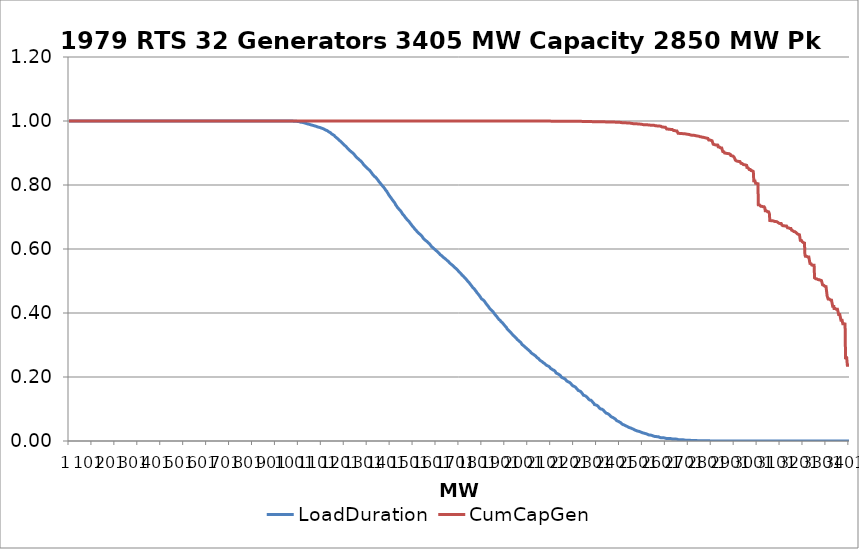
| Category | LoadDuration | CumCapGen |
|---|---|---|
| 0 | 1 | 1 |
| 1 | 1 | 1 |
| 2 | 1 | 1 |
| 3 | 1 | 1 |
| 4 | 1 | 1 |
| 5 | 1 | 1 |
| 6 | 1 | 1 |
| 7 | 1 | 1 |
| 8 | 1 | 1 |
| 9 | 1 | 1 |
| 10 | 1 | 1 |
| 11 | 1 | 1 |
| 12 | 1 | 1 |
| 13 | 1 | 1 |
| 14 | 1 | 1 |
| 15 | 1 | 1 |
| 16 | 1 | 1 |
| 17 | 1 | 1 |
| 18 | 1 | 1 |
| 19 | 1 | 1 |
| 20 | 1 | 1 |
| 21 | 1 | 1 |
| 22 | 1 | 1 |
| 23 | 1 | 1 |
| 24 | 1 | 1 |
| 25 | 1 | 1 |
| 26 | 1 | 1 |
| 27 | 1 | 1 |
| 28 | 1 | 1 |
| 29 | 1 | 1 |
| 30 | 1 | 1 |
| 31 | 1 | 1 |
| 32 | 1 | 1 |
| 33 | 1 | 1 |
| 34 | 1 | 1 |
| 35 | 1 | 1 |
| 36 | 1 | 1 |
| 37 | 1 | 1 |
| 38 | 1 | 1 |
| 39 | 1 | 1 |
| 40 | 1 | 1 |
| 41 | 1 | 1 |
| 42 | 1 | 1 |
| 43 | 1 | 1 |
| 44 | 1 | 1 |
| 45 | 1 | 1 |
| 46 | 1 | 1 |
| 47 | 1 | 1 |
| 48 | 1 | 1 |
| 49 | 1 | 1 |
| 50 | 1 | 1 |
| 51 | 1 | 1 |
| 52 | 1 | 1 |
| 53 | 1 | 1 |
| 54 | 1 | 1 |
| 55 | 1 | 1 |
| 56 | 1 | 1 |
| 57 | 1 | 1 |
| 58 | 1 | 1 |
| 59 | 1 | 1 |
| 60 | 1 | 1 |
| 61 | 1 | 1 |
| 62 | 1 | 1 |
| 63 | 1 | 1 |
| 64 | 1 | 1 |
| 65 | 1 | 1 |
| 66 | 1 | 1 |
| 67 | 1 | 1 |
| 68 | 1 | 1 |
| 69 | 1 | 1 |
| 70 | 1 | 1 |
| 71 | 1 | 1 |
| 72 | 1 | 1 |
| 73 | 1 | 1 |
| 74 | 1 | 1 |
| 75 | 1 | 1 |
| 76 | 1 | 1 |
| 77 | 1 | 1 |
| 78 | 1 | 1 |
| 79 | 1 | 1 |
| 80 | 1 | 1 |
| 81 | 1 | 1 |
| 82 | 1 | 1 |
| 83 | 1 | 1 |
| 84 | 1 | 1 |
| 85 | 1 | 1 |
| 86 | 1 | 1 |
| 87 | 1 | 1 |
| 88 | 1 | 1 |
| 89 | 1 | 1 |
| 90 | 1 | 1 |
| 91 | 1 | 1 |
| 92 | 1 | 1 |
| 93 | 1 | 1 |
| 94 | 1 | 1 |
| 95 | 1 | 1 |
| 96 | 1 | 1 |
| 97 | 1 | 1 |
| 98 | 1 | 1 |
| 99 | 1 | 1 |
| 100 | 1 | 1 |
| 101 | 1 | 1 |
| 102 | 1 | 1 |
| 103 | 1 | 1 |
| 104 | 1 | 1 |
| 105 | 1 | 1 |
| 106 | 1 | 1 |
| 107 | 1 | 1 |
| 108 | 1 | 1 |
| 109 | 1 | 1 |
| 110 | 1 | 1 |
| 111 | 1 | 1 |
| 112 | 1 | 1 |
| 113 | 1 | 1 |
| 114 | 1 | 1 |
| 115 | 1 | 1 |
| 116 | 1 | 1 |
| 117 | 1 | 1 |
| 118 | 1 | 1 |
| 119 | 1 | 1 |
| 120 | 1 | 1 |
| 121 | 1 | 1 |
| 122 | 1 | 1 |
| 123 | 1 | 1 |
| 124 | 1 | 1 |
| 125 | 1 | 1 |
| 126 | 1 | 1 |
| 127 | 1 | 1 |
| 128 | 1 | 1 |
| 129 | 1 | 1 |
| 130 | 1 | 1 |
| 131 | 1 | 1 |
| 132 | 1 | 1 |
| 133 | 1 | 1 |
| 134 | 1 | 1 |
| 135 | 1 | 1 |
| 136 | 1 | 1 |
| 137 | 1 | 1 |
| 138 | 1 | 1 |
| 139 | 1 | 1 |
| 140 | 1 | 1 |
| 141 | 1 | 1 |
| 142 | 1 | 1 |
| 143 | 1 | 1 |
| 144 | 1 | 1 |
| 145 | 1 | 1 |
| 146 | 1 | 1 |
| 147 | 1 | 1 |
| 148 | 1 | 1 |
| 149 | 1 | 1 |
| 150 | 1 | 1 |
| 151 | 1 | 1 |
| 152 | 1 | 1 |
| 153 | 1 | 1 |
| 154 | 1 | 1 |
| 155 | 1 | 1 |
| 156 | 1 | 1 |
| 157 | 1 | 1 |
| 158 | 1 | 1 |
| 159 | 1 | 1 |
| 160 | 1 | 1 |
| 161 | 1 | 1 |
| 162 | 1 | 1 |
| 163 | 1 | 1 |
| 164 | 1 | 1 |
| 165 | 1 | 1 |
| 166 | 1 | 1 |
| 167 | 1 | 1 |
| 168 | 1 | 1 |
| 169 | 1 | 1 |
| 170 | 1 | 1 |
| 171 | 1 | 1 |
| 172 | 1 | 1 |
| 173 | 1 | 1 |
| 174 | 1 | 1 |
| 175 | 1 | 1 |
| 176 | 1 | 1 |
| 177 | 1 | 1 |
| 178 | 1 | 1 |
| 179 | 1 | 1 |
| 180 | 1 | 1 |
| 181 | 1 | 1 |
| 182 | 1 | 1 |
| 183 | 1 | 1 |
| 184 | 1 | 1 |
| 185 | 1 | 1 |
| 186 | 1 | 1 |
| 187 | 1 | 1 |
| 188 | 1 | 1 |
| 189 | 1 | 1 |
| 190 | 1 | 1 |
| 191 | 1 | 1 |
| 192 | 1 | 1 |
| 193 | 1 | 1 |
| 194 | 1 | 1 |
| 195 | 1 | 1 |
| 196 | 1 | 1 |
| 197 | 1 | 1 |
| 198 | 1 | 1 |
| 199 | 1 | 1 |
| 200 | 1 | 1 |
| 201 | 1 | 1 |
| 202 | 1 | 1 |
| 203 | 1 | 1 |
| 204 | 1 | 1 |
| 205 | 1 | 1 |
| 206 | 1 | 1 |
| 207 | 1 | 1 |
| 208 | 1 | 1 |
| 209 | 1 | 1 |
| 210 | 1 | 1 |
| 211 | 1 | 1 |
| 212 | 1 | 1 |
| 213 | 1 | 1 |
| 214 | 1 | 1 |
| 215 | 1 | 1 |
| 216 | 1 | 1 |
| 217 | 1 | 1 |
| 218 | 1 | 1 |
| 219 | 1 | 1 |
| 220 | 1 | 1 |
| 221 | 1 | 1 |
| 222 | 1 | 1 |
| 223 | 1 | 1 |
| 224 | 1 | 1 |
| 225 | 1 | 1 |
| 226 | 1 | 1 |
| 227 | 1 | 1 |
| 228 | 1 | 1 |
| 229 | 1 | 1 |
| 230 | 1 | 1 |
| 231 | 1 | 1 |
| 232 | 1 | 1 |
| 233 | 1 | 1 |
| 234 | 1 | 1 |
| 235 | 1 | 1 |
| 236 | 1 | 1 |
| 237 | 1 | 1 |
| 238 | 1 | 1 |
| 239 | 1 | 1 |
| 240 | 1 | 1 |
| 241 | 1 | 1 |
| 242 | 1 | 1 |
| 243 | 1 | 1 |
| 244 | 1 | 1 |
| 245 | 1 | 1 |
| 246 | 1 | 1 |
| 247 | 1 | 1 |
| 248 | 1 | 1 |
| 249 | 1 | 1 |
| 250 | 1 | 1 |
| 251 | 1 | 1 |
| 252 | 1 | 1 |
| 253 | 1 | 1 |
| 254 | 1 | 1 |
| 255 | 1 | 1 |
| 256 | 1 | 1 |
| 257 | 1 | 1 |
| 258 | 1 | 1 |
| 259 | 1 | 1 |
| 260 | 1 | 1 |
| 261 | 1 | 1 |
| 262 | 1 | 1 |
| 263 | 1 | 1 |
| 264 | 1 | 1 |
| 265 | 1 | 1 |
| 266 | 1 | 1 |
| 267 | 1 | 1 |
| 268 | 1 | 1 |
| 269 | 1 | 1 |
| 270 | 1 | 1 |
| 271 | 1 | 1 |
| 272 | 1 | 1 |
| 273 | 1 | 1 |
| 274 | 1 | 1 |
| 275 | 1 | 1 |
| 276 | 1 | 1 |
| 277 | 1 | 1 |
| 278 | 1 | 1 |
| 279 | 1 | 1 |
| 280 | 1 | 1 |
| 281 | 1 | 1 |
| 282 | 1 | 1 |
| 283 | 1 | 1 |
| 284 | 1 | 1 |
| 285 | 1 | 1 |
| 286 | 1 | 1 |
| 287 | 1 | 1 |
| 288 | 1 | 1 |
| 289 | 1 | 1 |
| 290 | 1 | 1 |
| 291 | 1 | 1 |
| 292 | 1 | 1 |
| 293 | 1 | 1 |
| 294 | 1 | 1 |
| 295 | 1 | 1 |
| 296 | 1 | 1 |
| 297 | 1 | 1 |
| 298 | 1 | 1 |
| 299 | 1 | 1 |
| 300 | 1 | 1 |
| 301 | 1 | 1 |
| 302 | 1 | 1 |
| 303 | 1 | 1 |
| 304 | 1 | 1 |
| 305 | 1 | 1 |
| 306 | 1 | 1 |
| 307 | 1 | 1 |
| 308 | 1 | 1 |
| 309 | 1 | 1 |
| 310 | 1 | 1 |
| 311 | 1 | 1 |
| 312 | 1 | 1 |
| 313 | 1 | 1 |
| 314 | 1 | 1 |
| 315 | 1 | 1 |
| 316 | 1 | 1 |
| 317 | 1 | 1 |
| 318 | 1 | 1 |
| 319 | 1 | 1 |
| 320 | 1 | 1 |
| 321 | 1 | 1 |
| 322 | 1 | 1 |
| 323 | 1 | 1 |
| 324 | 1 | 1 |
| 325 | 1 | 1 |
| 326 | 1 | 1 |
| 327 | 1 | 1 |
| 328 | 1 | 1 |
| 329 | 1 | 1 |
| 330 | 1 | 1 |
| 331 | 1 | 1 |
| 332 | 1 | 1 |
| 333 | 1 | 1 |
| 334 | 1 | 1 |
| 335 | 1 | 1 |
| 336 | 1 | 1 |
| 337 | 1 | 1 |
| 338 | 1 | 1 |
| 339 | 1 | 1 |
| 340 | 1 | 1 |
| 341 | 1 | 1 |
| 342 | 1 | 1 |
| 343 | 1 | 1 |
| 344 | 1 | 1 |
| 345 | 1 | 1 |
| 346 | 1 | 1 |
| 347 | 1 | 1 |
| 348 | 1 | 1 |
| 349 | 1 | 1 |
| 350 | 1 | 1 |
| 351 | 1 | 1 |
| 352 | 1 | 1 |
| 353 | 1 | 1 |
| 354 | 1 | 1 |
| 355 | 1 | 1 |
| 356 | 1 | 1 |
| 357 | 1 | 1 |
| 358 | 1 | 1 |
| 359 | 1 | 1 |
| 360 | 1 | 1 |
| 361 | 1 | 1 |
| 362 | 1 | 1 |
| 363 | 1 | 1 |
| 364 | 1 | 1 |
| 365 | 1 | 1 |
| 366 | 1 | 1 |
| 367 | 1 | 1 |
| 368 | 1 | 1 |
| 369 | 1 | 1 |
| 370 | 1 | 1 |
| 371 | 1 | 1 |
| 372 | 1 | 1 |
| 373 | 1 | 1 |
| 374 | 1 | 1 |
| 375 | 1 | 1 |
| 376 | 1 | 1 |
| 377 | 1 | 1 |
| 378 | 1 | 1 |
| 379 | 1 | 1 |
| 380 | 1 | 1 |
| 381 | 1 | 1 |
| 382 | 1 | 1 |
| 383 | 1 | 1 |
| 384 | 1 | 1 |
| 385 | 1 | 1 |
| 386 | 1 | 1 |
| 387 | 1 | 1 |
| 388 | 1 | 1 |
| 389 | 1 | 1 |
| 390 | 1 | 1 |
| 391 | 1 | 1 |
| 392 | 1 | 1 |
| 393 | 1 | 1 |
| 394 | 1 | 1 |
| 395 | 1 | 1 |
| 396 | 1 | 1 |
| 397 | 1 | 1 |
| 398 | 1 | 1 |
| 399 | 1 | 1 |
| 400 | 1 | 1 |
| 401 | 1 | 1 |
| 402 | 1 | 1 |
| 403 | 1 | 1 |
| 404 | 1 | 1 |
| 405 | 1 | 1 |
| 406 | 1 | 1 |
| 407 | 1 | 1 |
| 408 | 1 | 1 |
| 409 | 1 | 1 |
| 410 | 1 | 1 |
| 411 | 1 | 1 |
| 412 | 1 | 1 |
| 413 | 1 | 1 |
| 414 | 1 | 1 |
| 415 | 1 | 1 |
| 416 | 1 | 1 |
| 417 | 1 | 1 |
| 418 | 1 | 1 |
| 419 | 1 | 1 |
| 420 | 1 | 1 |
| 421 | 1 | 1 |
| 422 | 1 | 1 |
| 423 | 1 | 1 |
| 424 | 1 | 1 |
| 425 | 1 | 1 |
| 426 | 1 | 1 |
| 427 | 1 | 1 |
| 428 | 1 | 1 |
| 429 | 1 | 1 |
| 430 | 1 | 1 |
| 431 | 1 | 1 |
| 432 | 1 | 1 |
| 433 | 1 | 1 |
| 434 | 1 | 1 |
| 435 | 1 | 1 |
| 436 | 1 | 1 |
| 437 | 1 | 1 |
| 438 | 1 | 1 |
| 439 | 1 | 1 |
| 440 | 1 | 1 |
| 441 | 1 | 1 |
| 442 | 1 | 1 |
| 443 | 1 | 1 |
| 444 | 1 | 1 |
| 445 | 1 | 1 |
| 446 | 1 | 1 |
| 447 | 1 | 1 |
| 448 | 1 | 1 |
| 449 | 1 | 1 |
| 450 | 1 | 1 |
| 451 | 1 | 1 |
| 452 | 1 | 1 |
| 453 | 1 | 1 |
| 454 | 1 | 1 |
| 455 | 1 | 1 |
| 456 | 1 | 1 |
| 457 | 1 | 1 |
| 458 | 1 | 1 |
| 459 | 1 | 1 |
| 460 | 1 | 1 |
| 461 | 1 | 1 |
| 462 | 1 | 1 |
| 463 | 1 | 1 |
| 464 | 1 | 1 |
| 465 | 1 | 1 |
| 466 | 1 | 1 |
| 467 | 1 | 1 |
| 468 | 1 | 1 |
| 469 | 1 | 1 |
| 470 | 1 | 1 |
| 471 | 1 | 1 |
| 472 | 1 | 1 |
| 473 | 1 | 1 |
| 474 | 1 | 1 |
| 475 | 1 | 1 |
| 476 | 1 | 1 |
| 477 | 1 | 1 |
| 478 | 1 | 1 |
| 479 | 1 | 1 |
| 480 | 1 | 1 |
| 481 | 1 | 1 |
| 482 | 1 | 1 |
| 483 | 1 | 1 |
| 484 | 1 | 1 |
| 485 | 1 | 1 |
| 486 | 1 | 1 |
| 487 | 1 | 1 |
| 488 | 1 | 1 |
| 489 | 1 | 1 |
| 490 | 1 | 1 |
| 491 | 1 | 1 |
| 492 | 1 | 1 |
| 493 | 1 | 1 |
| 494 | 1 | 1 |
| 495 | 1 | 1 |
| 496 | 1 | 1 |
| 497 | 1 | 1 |
| 498 | 1 | 1 |
| 499 | 1 | 1 |
| 500 | 1 | 1 |
| 501 | 1 | 1 |
| 502 | 1 | 1 |
| 503 | 1 | 1 |
| 504 | 1 | 1 |
| 505 | 1 | 1 |
| 506 | 1 | 1 |
| 507 | 1 | 1 |
| 508 | 1 | 1 |
| 509 | 1 | 1 |
| 510 | 1 | 1 |
| 511 | 1 | 1 |
| 512 | 1 | 1 |
| 513 | 1 | 1 |
| 514 | 1 | 1 |
| 515 | 1 | 1 |
| 516 | 1 | 1 |
| 517 | 1 | 1 |
| 518 | 1 | 1 |
| 519 | 1 | 1 |
| 520 | 1 | 1 |
| 521 | 1 | 1 |
| 522 | 1 | 1 |
| 523 | 1 | 1 |
| 524 | 1 | 1 |
| 525 | 1 | 1 |
| 526 | 1 | 1 |
| 527 | 1 | 1 |
| 528 | 1 | 1 |
| 529 | 1 | 1 |
| 530 | 1 | 1 |
| 531 | 1 | 1 |
| 532 | 1 | 1 |
| 533 | 1 | 1 |
| 534 | 1 | 1 |
| 535 | 1 | 1 |
| 536 | 1 | 1 |
| 537 | 1 | 1 |
| 538 | 1 | 1 |
| 539 | 1 | 1 |
| 540 | 1 | 1 |
| 541 | 1 | 1 |
| 542 | 1 | 1 |
| 543 | 1 | 1 |
| 544 | 1 | 1 |
| 545 | 1 | 1 |
| 546 | 1 | 1 |
| 547 | 1 | 1 |
| 548 | 1 | 1 |
| 549 | 1 | 1 |
| 550 | 1 | 1 |
| 551 | 1 | 1 |
| 552 | 1 | 1 |
| 553 | 1 | 1 |
| 554 | 1 | 1 |
| 555 | 1 | 1 |
| 556 | 1 | 1 |
| 557 | 1 | 1 |
| 558 | 1 | 1 |
| 559 | 1 | 1 |
| 560 | 1 | 1 |
| 561 | 1 | 1 |
| 562 | 1 | 1 |
| 563 | 1 | 1 |
| 564 | 1 | 1 |
| 565 | 1 | 1 |
| 566 | 1 | 1 |
| 567 | 1 | 1 |
| 568 | 1 | 1 |
| 569 | 1 | 1 |
| 570 | 1 | 1 |
| 571 | 1 | 1 |
| 572 | 1 | 1 |
| 573 | 1 | 1 |
| 574 | 1 | 1 |
| 575 | 1 | 1 |
| 576 | 1 | 1 |
| 577 | 1 | 1 |
| 578 | 1 | 1 |
| 579 | 1 | 1 |
| 580 | 1 | 1 |
| 581 | 1 | 1 |
| 582 | 1 | 1 |
| 583 | 1 | 1 |
| 584 | 1 | 1 |
| 585 | 1 | 1 |
| 586 | 1 | 1 |
| 587 | 1 | 1 |
| 588 | 1 | 1 |
| 589 | 1 | 1 |
| 590 | 1 | 1 |
| 591 | 1 | 1 |
| 592 | 1 | 1 |
| 593 | 1 | 1 |
| 594 | 1 | 1 |
| 595 | 1 | 1 |
| 596 | 1 | 1 |
| 597 | 1 | 1 |
| 598 | 1 | 1 |
| 599 | 1 | 1 |
| 600 | 1 | 1 |
| 601 | 1 | 1 |
| 602 | 1 | 1 |
| 603 | 1 | 1 |
| 604 | 1 | 1 |
| 605 | 1 | 1 |
| 606 | 1 | 1 |
| 607 | 1 | 1 |
| 608 | 1 | 1 |
| 609 | 1 | 1 |
| 610 | 1 | 1 |
| 611 | 1 | 1 |
| 612 | 1 | 1 |
| 613 | 1 | 1 |
| 614 | 1 | 1 |
| 615 | 1 | 1 |
| 616 | 1 | 1 |
| 617 | 1 | 1 |
| 618 | 1 | 1 |
| 619 | 1 | 1 |
| 620 | 1 | 1 |
| 621 | 1 | 1 |
| 622 | 1 | 1 |
| 623 | 1 | 1 |
| 624 | 1 | 1 |
| 625 | 1 | 1 |
| 626 | 1 | 1 |
| 627 | 1 | 1 |
| 628 | 1 | 1 |
| 629 | 1 | 1 |
| 630 | 1 | 1 |
| 631 | 1 | 1 |
| 632 | 1 | 1 |
| 633 | 1 | 1 |
| 634 | 1 | 1 |
| 635 | 1 | 1 |
| 636 | 1 | 1 |
| 637 | 1 | 1 |
| 638 | 1 | 1 |
| 639 | 1 | 1 |
| 640 | 1 | 1 |
| 641 | 1 | 1 |
| 642 | 1 | 1 |
| 643 | 1 | 1 |
| 644 | 1 | 1 |
| 645 | 1 | 1 |
| 646 | 1 | 1 |
| 647 | 1 | 1 |
| 648 | 1 | 1 |
| 649 | 1 | 1 |
| 650 | 1 | 1 |
| 651 | 1 | 1 |
| 652 | 1 | 1 |
| 653 | 1 | 1 |
| 654 | 1 | 1 |
| 655 | 1 | 1 |
| 656 | 1 | 1 |
| 657 | 1 | 1 |
| 658 | 1 | 1 |
| 659 | 1 | 1 |
| 660 | 1 | 1 |
| 661 | 1 | 1 |
| 662 | 1 | 1 |
| 663 | 1 | 1 |
| 664 | 1 | 1 |
| 665 | 1 | 1 |
| 666 | 1 | 1 |
| 667 | 1 | 1 |
| 668 | 1 | 1 |
| 669 | 1 | 1 |
| 670 | 1 | 1 |
| 671 | 1 | 1 |
| 672 | 1 | 1 |
| 673 | 1 | 1 |
| 674 | 1 | 1 |
| 675 | 1 | 1 |
| 676 | 1 | 1 |
| 677 | 1 | 1 |
| 678 | 1 | 1 |
| 679 | 1 | 1 |
| 680 | 1 | 1 |
| 681 | 1 | 1 |
| 682 | 1 | 1 |
| 683 | 1 | 1 |
| 684 | 1 | 1 |
| 685 | 1 | 1 |
| 686 | 1 | 1 |
| 687 | 1 | 1 |
| 688 | 1 | 1 |
| 689 | 1 | 1 |
| 690 | 1 | 1 |
| 691 | 1 | 1 |
| 692 | 1 | 1 |
| 693 | 1 | 1 |
| 694 | 1 | 1 |
| 695 | 1 | 1 |
| 696 | 1 | 1 |
| 697 | 1 | 1 |
| 698 | 1 | 1 |
| 699 | 1 | 1 |
| 700 | 1 | 1 |
| 701 | 1 | 1 |
| 702 | 1 | 1 |
| 703 | 1 | 1 |
| 704 | 1 | 1 |
| 705 | 1 | 1 |
| 706 | 1 | 1 |
| 707 | 1 | 1 |
| 708 | 1 | 1 |
| 709 | 1 | 1 |
| 710 | 1 | 1 |
| 711 | 1 | 1 |
| 712 | 1 | 1 |
| 713 | 1 | 1 |
| 714 | 1 | 1 |
| 715 | 1 | 1 |
| 716 | 1 | 1 |
| 717 | 1 | 1 |
| 718 | 1 | 1 |
| 719 | 1 | 1 |
| 720 | 1 | 1 |
| 721 | 1 | 1 |
| 722 | 1 | 1 |
| 723 | 1 | 1 |
| 724 | 1 | 1 |
| 725 | 1 | 1 |
| 726 | 1 | 1 |
| 727 | 1 | 1 |
| 728 | 1 | 1 |
| 729 | 1 | 1 |
| 730 | 1 | 1 |
| 731 | 1 | 1 |
| 732 | 1 | 1 |
| 733 | 1 | 1 |
| 734 | 1 | 1 |
| 735 | 1 | 1 |
| 736 | 1 | 1 |
| 737 | 1 | 1 |
| 738 | 1 | 1 |
| 739 | 1 | 1 |
| 740 | 1 | 1 |
| 741 | 1 | 1 |
| 742 | 1 | 1 |
| 743 | 1 | 1 |
| 744 | 1 | 1 |
| 745 | 1 | 1 |
| 746 | 1 | 1 |
| 747 | 1 | 1 |
| 748 | 1 | 1 |
| 749 | 1 | 1 |
| 750 | 1 | 1 |
| 751 | 1 | 1 |
| 752 | 1 | 1 |
| 753 | 1 | 1 |
| 754 | 1 | 1 |
| 755 | 1 | 1 |
| 756 | 1 | 1 |
| 757 | 1 | 1 |
| 758 | 1 | 1 |
| 759 | 1 | 1 |
| 760 | 1 | 1 |
| 761 | 1 | 1 |
| 762 | 1 | 1 |
| 763 | 1 | 1 |
| 764 | 1 | 1 |
| 765 | 1 | 1 |
| 766 | 1 | 1 |
| 767 | 1 | 1 |
| 768 | 1 | 1 |
| 769 | 1 | 1 |
| 770 | 1 | 1 |
| 771 | 1 | 1 |
| 772 | 1 | 1 |
| 773 | 1 | 1 |
| 774 | 1 | 1 |
| 775 | 1 | 1 |
| 776 | 1 | 1 |
| 777 | 1 | 1 |
| 778 | 1 | 1 |
| 779 | 1 | 1 |
| 780 | 1 | 1 |
| 781 | 1 | 1 |
| 782 | 1 | 1 |
| 783 | 1 | 1 |
| 784 | 1 | 1 |
| 785 | 1 | 1 |
| 786 | 1 | 1 |
| 787 | 1 | 1 |
| 788 | 1 | 1 |
| 789 | 1 | 1 |
| 790 | 1 | 1 |
| 791 | 1 | 1 |
| 792 | 1 | 1 |
| 793 | 1 | 1 |
| 794 | 1 | 1 |
| 795 | 1 | 1 |
| 796 | 1 | 1 |
| 797 | 1 | 1 |
| 798 | 1 | 1 |
| 799 | 1 | 1 |
| 800 | 1 | 1 |
| 801 | 1 | 1 |
| 802 | 1 | 1 |
| 803 | 1 | 1 |
| 804 | 1 | 1 |
| 805 | 1 | 1 |
| 806 | 1 | 1 |
| 807 | 1 | 1 |
| 808 | 1 | 1 |
| 809 | 1 | 1 |
| 810 | 1 | 1 |
| 811 | 1 | 1 |
| 812 | 1 | 1 |
| 813 | 1 | 1 |
| 814 | 1 | 1 |
| 815 | 1 | 1 |
| 816 | 1 | 1 |
| 817 | 1 | 1 |
| 818 | 1 | 1 |
| 819 | 1 | 1 |
| 820 | 1 | 1 |
| 821 | 1 | 1 |
| 822 | 1 | 1 |
| 823 | 1 | 1 |
| 824 | 1 | 1 |
| 825 | 1 | 1 |
| 826 | 1 | 1 |
| 827 | 1 | 1 |
| 828 | 1 | 1 |
| 829 | 1 | 1 |
| 830 | 1 | 1 |
| 831 | 1 | 1 |
| 832 | 1 | 1 |
| 833 | 1 | 1 |
| 834 | 1 | 1 |
| 835 | 1 | 1 |
| 836 | 1 | 1 |
| 837 | 1 | 1 |
| 838 | 1 | 1 |
| 839 | 1 | 1 |
| 840 | 1 | 1 |
| 841 | 1 | 1 |
| 842 | 1 | 1 |
| 843 | 1 | 1 |
| 844 | 1 | 1 |
| 845 | 1 | 1 |
| 846 | 1 | 1 |
| 847 | 1 | 1 |
| 848 | 1 | 1 |
| 849 | 1 | 1 |
| 850 | 1 | 1 |
| 851 | 1 | 1 |
| 852 | 1 | 1 |
| 853 | 1 | 1 |
| 854 | 1 | 1 |
| 855 | 1 | 1 |
| 856 | 1 | 1 |
| 857 | 1 | 1 |
| 858 | 1 | 1 |
| 859 | 1 | 1 |
| 860 | 1 | 1 |
| 861 | 1 | 1 |
| 862 | 1 | 1 |
| 863 | 1 | 1 |
| 864 | 1 | 1 |
| 865 | 1 | 1 |
| 866 | 1 | 1 |
| 867 | 1 | 1 |
| 868 | 1 | 1 |
| 869 | 1 | 1 |
| 870 | 1 | 1 |
| 871 | 1 | 1 |
| 872 | 1 | 1 |
| 873 | 1 | 1 |
| 874 | 1 | 1 |
| 875 | 1 | 1 |
| 876 | 1 | 1 |
| 877 | 1 | 1 |
| 878 | 1 | 1 |
| 879 | 1 | 1 |
| 880 | 1 | 1 |
| 881 | 1 | 1 |
| 882 | 1 | 1 |
| 883 | 1 | 1 |
| 884 | 1 | 1 |
| 885 | 1 | 1 |
| 886 | 1 | 1 |
| 887 | 1 | 1 |
| 888 | 1 | 1 |
| 889 | 1 | 1 |
| 890 | 1 | 1 |
| 891 | 1 | 1 |
| 892 | 1 | 1 |
| 893 | 1 | 1 |
| 894 | 1 | 1 |
| 895 | 1 | 1 |
| 896 | 1 | 1 |
| 897 | 1 | 1 |
| 898 | 1 | 1 |
| 899 | 1 | 1 |
| 900 | 1 | 1 |
| 901 | 1 | 1 |
| 902 | 1 | 1 |
| 903 | 1 | 1 |
| 904 | 1 | 1 |
| 905 | 1 | 1 |
| 906 | 1 | 1 |
| 907 | 1 | 1 |
| 908 | 1 | 1 |
| 909 | 1 | 1 |
| 910 | 1 | 1 |
| 911 | 1 | 1 |
| 912 | 1 | 1 |
| 913 | 1 | 1 |
| 914 | 1 | 1 |
| 915 | 1 | 1 |
| 916 | 1 | 1 |
| 917 | 1 | 1 |
| 918 | 1 | 1 |
| 919 | 1 | 1 |
| 920 | 1 | 1 |
| 921 | 1 | 1 |
| 922 | 1 | 1 |
| 923 | 1 | 1 |
| 924 | 1 | 1 |
| 925 | 1 | 1 |
| 926 | 1 | 1 |
| 927 | 1 | 1 |
| 928 | 1 | 1 |
| 929 | 1 | 1 |
| 930 | 1 | 1 |
| 931 | 1 | 1 |
| 932 | 1 | 1 |
| 933 | 1 | 1 |
| 934 | 1 | 1 |
| 935 | 1 | 1 |
| 936 | 1 | 1 |
| 937 | 1 | 1 |
| 938 | 1 | 1 |
| 939 | 1 | 1 |
| 940 | 1 | 1 |
| 941 | 1 | 1 |
| 942 | 1 | 1 |
| 943 | 1 | 1 |
| 944 | 1 | 1 |
| 945 | 1 | 1 |
| 946 | 1 | 1 |
| 947 | 1 | 1 |
| 948 | 1 | 1 |
| 949 | 1 | 1 |
| 950 | 1 | 1 |
| 951 | 1 | 1 |
| 952 | 1 | 1 |
| 953 | 1 | 1 |
| 954 | 1 | 1 |
| 955 | 1 | 1 |
| 956 | 1 | 1 |
| 957 | 1 | 1 |
| 958 | 1 | 1 |
| 959 | 1 | 1 |
| 960 | 1 | 1 |
| 961 | 1 | 1 |
| 962 | 1 | 1 |
| 963 | 1 | 1 |
| 964 | 1 | 1 |
| 965 | 1 | 1 |
| 966 | 1 | 1 |
| 967 | 1 | 1 |
| 968 | 1 | 1 |
| 969 | 1 | 1 |
| 970 | 1 | 1 |
| 971 | 1 | 1 |
| 972 | 1 | 1 |
| 973 | 1 | 1 |
| 974 | 1 | 1 |
| 975 | 1 | 1 |
| 976 | 1 | 1 |
| 977 | 1 | 1 |
| 978 | 1 | 1 |
| 979 | 0.999 | 1 |
| 980 | 0.999 | 1 |
| 981 | 0.999 | 1 |
| 982 | 0.999 | 1 |
| 983 | 0.999 | 1 |
| 984 | 0.999 | 1 |
| 985 | 0.999 | 1 |
| 986 | 0.999 | 1 |
| 987 | 0.999 | 1 |
| 988 | 0.999 | 1 |
| 989 | 0.999 | 1 |
| 990 | 0.999 | 1 |
| 991 | 0.999 | 1 |
| 992 | 0.999 | 1 |
| 993 | 0.999 | 1 |
| 994 | 0.999 | 1 |
| 995 | 0.999 | 1 |
| 996 | 0.999 | 1 |
| 997 | 0.999 | 1 |
| 998 | 0.999 | 1 |
| 999 | 0.999 | 1 |
| 1000 | 0.998 | 1 |
| 1001 | 0.998 | 1 |
| 1002 | 0.998 | 1 |
| 1003 | 0.998 | 1 |
| 1004 | 0.998 | 1 |
| 1005 | 0.997 | 1 |
| 1006 | 0.997 | 1 |
| 1007 | 0.997 | 1 |
| 1008 | 0.997 | 1 |
| 1009 | 0.996 | 1 |
| 1010 | 0.996 | 1 |
| 1011 | 0.996 | 1 |
| 1012 | 0.996 | 1 |
| 1013 | 0.996 | 1 |
| 1014 | 0.996 | 1 |
| 1015 | 0.996 | 1 |
| 1016 | 0.996 | 1 |
| 1017 | 0.996 | 1 |
| 1018 | 0.996 | 1 |
| 1019 | 0.996 | 1 |
| 1020 | 0.995 | 1 |
| 1021 | 0.995 | 1 |
| 1022 | 0.995 | 1 |
| 1023 | 0.995 | 1 |
| 1024 | 0.994 | 1 |
| 1025 | 0.994 | 1 |
| 1026 | 0.994 | 1 |
| 1027 | 0.994 | 1 |
| 1028 | 0.994 | 1 |
| 1029 | 0.993 | 1 |
| 1030 | 0.993 | 1 |
| 1031 | 0.993 | 1 |
| 1032 | 0.993 | 1 |
| 1033 | 0.992 | 1 |
| 1034 | 0.992 | 1 |
| 1035 | 0.992 | 1 |
| 1036 | 0.992 | 1 |
| 1037 | 0.991 | 1 |
| 1038 | 0.991 | 1 |
| 1039 | 0.991 | 1 |
| 1040 | 0.991 | 1 |
| 1041 | 0.991 | 1 |
| 1042 | 0.991 | 1 |
| 1043 | 0.99 | 1 |
| 1044 | 0.99 | 1 |
| 1045 | 0.99 | 1 |
| 1046 | 0.99 | 1 |
| 1047 | 0.99 | 1 |
| 1048 | 0.99 | 1 |
| 1049 | 0.989 | 1 |
| 1050 | 0.989 | 1 |
| 1051 | 0.989 | 1 |
| 1052 | 0.988 | 1 |
| 1053 | 0.988 | 1 |
| 1054 | 0.988 | 1 |
| 1055 | 0.988 | 1 |
| 1056 | 0.987 | 1 |
| 1057 | 0.987 | 1 |
| 1058 | 0.987 | 1 |
| 1059 | 0.987 | 1 |
| 1060 | 0.987 | 1 |
| 1061 | 0.987 | 1 |
| 1062 | 0.986 | 1 |
| 1063 | 0.986 | 1 |
| 1064 | 0.986 | 1 |
| 1065 | 0.986 | 1 |
| 1066 | 0.986 | 1 |
| 1067 | 0.985 | 1 |
| 1068 | 0.985 | 1 |
| 1069 | 0.985 | 1 |
| 1070 | 0.985 | 1 |
| 1071 | 0.985 | 1 |
| 1072 | 0.984 | 1 |
| 1073 | 0.984 | 1 |
| 1074 | 0.984 | 1 |
| 1075 | 0.984 | 1 |
| 1076 | 0.983 | 1 |
| 1077 | 0.983 | 1 |
| 1078 | 0.983 | 1 |
| 1079 | 0.983 | 1 |
| 1080 | 0.982 | 1 |
| 1081 | 0.982 | 1 |
| 1082 | 0.982 | 1 |
| 1083 | 0.982 | 1 |
| 1084 | 0.981 | 1 |
| 1085 | 0.981 | 1 |
| 1086 | 0.981 | 1 |
| 1087 | 0.981 | 1 |
| 1088 | 0.981 | 1 |
| 1089 | 0.981 | 1 |
| 1090 | 0.98 | 1 |
| 1091 | 0.98 | 1 |
| 1092 | 0.98 | 1 |
| 1093 | 0.98 | 1 |
| 1094 | 0.979 | 1 |
| 1095 | 0.979 | 1 |
| 1096 | 0.979 | 1 |
| 1097 | 0.979 | 1 |
| 1098 | 0.978 | 1 |
| 1099 | 0.978 | 1 |
| 1100 | 0.978 | 1 |
| 1101 | 0.977 | 1 |
| 1102 | 0.977 | 1 |
| 1103 | 0.977 | 1 |
| 1104 | 0.977 | 1 |
| 1105 | 0.977 | 1 |
| 1106 | 0.976 | 1 |
| 1107 | 0.976 | 1 |
| 1108 | 0.976 | 1 |
| 1109 | 0.976 | 1 |
| 1110 | 0.975 | 1 |
| 1111 | 0.975 | 1 |
| 1112 | 0.974 | 1 |
| 1113 | 0.973 | 1 |
| 1114 | 0.973 | 1 |
| 1115 | 0.973 | 1 |
| 1116 | 0.973 | 1 |
| 1117 | 0.972 | 1 |
| 1118 | 0.972 | 1 |
| 1119 | 0.972 | 1 |
| 1120 | 0.971 | 1 |
| 1121 | 0.971 | 1 |
| 1122 | 0.971 | 1 |
| 1123 | 0.971 | 1 |
| 1124 | 0.971 | 1 |
| 1125 | 0.97 | 1 |
| 1126 | 0.97 | 1 |
| 1127 | 0.969 | 1 |
| 1128 | 0.969 | 1 |
| 1129 | 0.968 | 1 |
| 1130 | 0.967 | 1 |
| 1131 | 0.967 | 1 |
| 1132 | 0.966 | 1 |
| 1133 | 0.966 | 1 |
| 1134 | 0.965 | 1 |
| 1135 | 0.965 | 1 |
| 1136 | 0.965 | 1 |
| 1137 | 0.964 | 1 |
| 1138 | 0.964 | 1 |
| 1139 | 0.964 | 1 |
| 1140 | 0.963 | 1 |
| 1141 | 0.962 | 1 |
| 1142 | 0.961 | 1 |
| 1143 | 0.961 | 1 |
| 1144 | 0.96 | 1 |
| 1145 | 0.959 | 1 |
| 1146 | 0.959 | 1 |
| 1147 | 0.959 | 1 |
| 1148 | 0.959 | 1 |
| 1149 | 0.958 | 1 |
| 1150 | 0.957 | 1 |
| 1151 | 0.957 | 1 |
| 1152 | 0.957 | 1 |
| 1153 | 0.956 | 1 |
| 1154 | 0.956 | 1 |
| 1155 | 0.955 | 1 |
| 1156 | 0.955 | 1 |
| 1157 | 0.954 | 1 |
| 1158 | 0.953 | 1 |
| 1159 | 0.952 | 1 |
| 1160 | 0.951 | 1 |
| 1161 | 0.951 | 1 |
| 1162 | 0.95 | 1 |
| 1163 | 0.95 | 1 |
| 1164 | 0.949 | 1 |
| 1165 | 0.948 | 1 |
| 1166 | 0.947 | 1 |
| 1167 | 0.947 | 1 |
| 1168 | 0.946 | 1 |
| 1169 | 0.946 | 1 |
| 1170 | 0.945 | 1 |
| 1171 | 0.944 | 1 |
| 1172 | 0.944 | 1 |
| 1173 | 0.943 | 1 |
| 1174 | 0.942 | 1 |
| 1175 | 0.942 | 1 |
| 1176 | 0.941 | 1 |
| 1177 | 0.94 | 1 |
| 1178 | 0.94 | 1 |
| 1179 | 0.939 | 1 |
| 1180 | 0.938 | 1 |
| 1181 | 0.937 | 1 |
| 1182 | 0.937 | 1 |
| 1183 | 0.937 | 1 |
| 1184 | 0.936 | 1 |
| 1185 | 0.936 | 1 |
| 1186 | 0.935 | 1 |
| 1187 | 0.934 | 1 |
| 1188 | 0.934 | 1 |
| 1189 | 0.933 | 1 |
| 1190 | 0.932 | 1 |
| 1191 | 0.932 | 1 |
| 1192 | 0.931 | 1 |
| 1193 | 0.93 | 1 |
| 1194 | 0.929 | 1 |
| 1195 | 0.929 | 1 |
| 1196 | 0.928 | 1 |
| 1197 | 0.927 | 1 |
| 1198 | 0.926 | 1 |
| 1199 | 0.925 | 1 |
| 1200 | 0.925 | 1 |
| 1201 | 0.924 | 1 |
| 1202 | 0.924 | 1 |
| 1203 | 0.923 | 1 |
| 1204 | 0.922 | 1 |
| 1205 | 0.921 | 1 |
| 1206 | 0.921 | 1 |
| 1207 | 0.92 | 1 |
| 1208 | 0.919 | 1 |
| 1209 | 0.919 | 1 |
| 1210 | 0.918 | 1 |
| 1211 | 0.917 | 1 |
| 1212 | 0.916 | 1 |
| 1213 | 0.916 | 1 |
| 1214 | 0.915 | 1 |
| 1215 | 0.914 | 1 |
| 1216 | 0.914 | 1 |
| 1217 | 0.913 | 1 |
| 1218 | 0.912 | 1 |
| 1219 | 0.911 | 1 |
| 1220 | 0.911 | 1 |
| 1221 | 0.91 | 1 |
| 1222 | 0.909 | 1 |
| 1223 | 0.908 | 1 |
| 1224 | 0.908 | 1 |
| 1225 | 0.907 | 1 |
| 1226 | 0.906 | 1 |
| 1227 | 0.906 | 1 |
| 1228 | 0.905 | 1 |
| 1229 | 0.905 | 1 |
| 1230 | 0.904 | 1 |
| 1231 | 0.903 | 1 |
| 1232 | 0.903 | 1 |
| 1233 | 0.902 | 1 |
| 1234 | 0.902 | 1 |
| 1235 | 0.901 | 1 |
| 1236 | 0.9 | 1 |
| 1237 | 0.9 | 1 |
| 1238 | 0.899 | 1 |
| 1239 | 0.899 | 1 |
| 1240 | 0.898 | 1 |
| 1241 | 0.897 | 1 |
| 1242 | 0.896 | 1 |
| 1243 | 0.895 | 1 |
| 1244 | 0.894 | 1 |
| 1245 | 0.893 | 1 |
| 1246 | 0.893 | 1 |
| 1247 | 0.892 | 1 |
| 1248 | 0.891 | 1 |
| 1249 | 0.89 | 1 |
| 1250 | 0.889 | 1 |
| 1251 | 0.888 | 1 |
| 1252 | 0.887 | 1 |
| 1253 | 0.886 | 1 |
| 1254 | 0.886 | 1 |
| 1255 | 0.885 | 1 |
| 1256 | 0.884 | 1 |
| 1257 | 0.884 | 1 |
| 1258 | 0.883 | 1 |
| 1259 | 0.883 | 1 |
| 1260 | 0.882 | 1 |
| 1261 | 0.881 | 1 |
| 1262 | 0.881 | 1 |
| 1263 | 0.88 | 1 |
| 1264 | 0.879 | 1 |
| 1265 | 0.879 | 1 |
| 1266 | 0.878 | 1 |
| 1267 | 0.878 | 1 |
| 1268 | 0.877 | 1 |
| 1269 | 0.877 | 1 |
| 1270 | 0.876 | 1 |
| 1271 | 0.875 | 1 |
| 1272 | 0.874 | 1 |
| 1273 | 0.874 | 1 |
| 1274 | 0.873 | 1 |
| 1275 | 0.872 | 1 |
| 1276 | 0.871 | 1 |
| 1277 | 0.871 | 1 |
| 1278 | 0.87 | 1 |
| 1279 | 0.869 | 1 |
| 1280 | 0.868 | 1 |
| 1281 | 0.867 | 1 |
| 1282 | 0.866 | 1 |
| 1283 | 0.864 | 1 |
| 1284 | 0.863 | 1 |
| 1285 | 0.863 | 1 |
| 1286 | 0.862 | 1 |
| 1287 | 0.861 | 1 |
| 1288 | 0.861 | 1 |
| 1289 | 0.86 | 1 |
| 1290 | 0.859 | 1 |
| 1291 | 0.858 | 1 |
| 1292 | 0.858 | 1 |
| 1293 | 0.857 | 1 |
| 1294 | 0.857 | 1 |
| 1295 | 0.856 | 1 |
| 1296 | 0.855 | 1 |
| 1297 | 0.854 | 1 |
| 1298 | 0.854 | 1 |
| 1299 | 0.853 | 1 |
| 1300 | 0.852 | 1 |
| 1301 | 0.852 | 1 |
| 1302 | 0.851 | 1 |
| 1303 | 0.85 | 1 |
| 1304 | 0.85 | 1 |
| 1305 | 0.849 | 1 |
| 1306 | 0.848 | 1 |
| 1307 | 0.848 | 1 |
| 1308 | 0.847 | 1 |
| 1309 | 0.847 | 1 |
| 1310 | 0.846 | 1 |
| 1311 | 0.846 | 1 |
| 1312 | 0.845 | 1 |
| 1313 | 0.844 | 1 |
| 1314 | 0.843 | 1 |
| 1315 | 0.841 | 1 |
| 1316 | 0.84 | 1 |
| 1317 | 0.839 | 1 |
| 1318 | 0.838 | 1 |
| 1319 | 0.838 | 1 |
| 1320 | 0.837 | 1 |
| 1321 | 0.836 | 1 |
| 1322 | 0.835 | 1 |
| 1323 | 0.834 | 1 |
| 1324 | 0.832 | 1 |
| 1325 | 0.832 | 1 |
| 1326 | 0.831 | 1 |
| 1327 | 0.83 | 1 |
| 1328 | 0.829 | 1 |
| 1329 | 0.828 | 1 |
| 1330 | 0.828 | 1 |
| 1331 | 0.827 | 1 |
| 1332 | 0.827 | 1 |
| 1333 | 0.826 | 1 |
| 1334 | 0.826 | 1 |
| 1335 | 0.826 | 1 |
| 1336 | 0.825 | 1 |
| 1337 | 0.823 | 1 |
| 1338 | 0.822 | 1 |
| 1339 | 0.822 | 1 |
| 1340 | 0.821 | 1 |
| 1341 | 0.82 | 1 |
| 1342 | 0.819 | 1 |
| 1343 | 0.818 | 1 |
| 1344 | 0.817 | 1 |
| 1345 | 0.816 | 1 |
| 1346 | 0.816 | 1 |
| 1347 | 0.815 | 1 |
| 1348 | 0.814 | 1 |
| 1349 | 0.813 | 1 |
| 1350 | 0.812 | 1 |
| 1351 | 0.811 | 1 |
| 1352 | 0.809 | 1 |
| 1353 | 0.809 | 1 |
| 1354 | 0.808 | 1 |
| 1355 | 0.807 | 1 |
| 1356 | 0.806 | 1 |
| 1357 | 0.805 | 1 |
| 1358 | 0.804 | 1 |
| 1359 | 0.803 | 1 |
| 1360 | 0.802 | 1 |
| 1361 | 0.802 | 1 |
| 1362 | 0.8 | 1 |
| 1363 | 0.8 | 1 |
| 1364 | 0.799 | 1 |
| 1365 | 0.799 | 1 |
| 1366 | 0.798 | 1 |
| 1367 | 0.797 | 1 |
| 1368 | 0.796 | 1 |
| 1369 | 0.795 | 1 |
| 1370 | 0.794 | 1 |
| 1371 | 0.793 | 1 |
| 1372 | 0.793 | 1 |
| 1373 | 0.792 | 1 |
| 1374 | 0.791 | 1 |
| 1375 | 0.79 | 1 |
| 1376 | 0.789 | 1 |
| 1377 | 0.788 | 1 |
| 1378 | 0.786 | 1 |
| 1379 | 0.785 | 1 |
| 1380 | 0.784 | 1 |
| 1381 | 0.783 | 1 |
| 1382 | 0.783 | 1 |
| 1383 | 0.782 | 1 |
| 1384 | 0.781 | 1 |
| 1385 | 0.78 | 1 |
| 1386 | 0.779 | 1 |
| 1387 | 0.777 | 1 |
| 1388 | 0.776 | 1 |
| 1389 | 0.775 | 1 |
| 1390 | 0.774 | 1 |
| 1391 | 0.773 | 1 |
| 1392 | 0.771 | 1 |
| 1393 | 0.77 | 1 |
| 1394 | 0.769 | 1 |
| 1395 | 0.769 | 1 |
| 1396 | 0.767 | 1 |
| 1397 | 0.766 | 1 |
| 1398 | 0.765 | 1 |
| 1399 | 0.763 | 1 |
| 1400 | 0.763 | 1 |
| 1401 | 0.762 | 1 |
| 1402 | 0.761 | 1 |
| 1403 | 0.76 | 1 |
| 1404 | 0.759 | 1 |
| 1405 | 0.758 | 1 |
| 1406 | 0.757 | 1 |
| 1407 | 0.756 | 1 |
| 1408 | 0.754 | 1 |
| 1409 | 0.754 | 1 |
| 1410 | 0.753 | 1 |
| 1411 | 0.752 | 1 |
| 1412 | 0.752 | 1 |
| 1413 | 0.751 | 1 |
| 1414 | 0.75 | 1 |
| 1415 | 0.748 | 1 |
| 1416 | 0.747 | 1 |
| 1417 | 0.747 | 1 |
| 1418 | 0.745 | 1 |
| 1419 | 0.745 | 1 |
| 1420 | 0.743 | 1 |
| 1421 | 0.742 | 1 |
| 1422 | 0.741 | 1 |
| 1423 | 0.739 | 1 |
| 1424 | 0.738 | 1 |
| 1425 | 0.737 | 1 |
| 1426 | 0.735 | 1 |
| 1427 | 0.735 | 1 |
| 1428 | 0.734 | 1 |
| 1429 | 0.733 | 1 |
| 1430 | 0.731 | 1 |
| 1431 | 0.73 | 1 |
| 1432 | 0.73 | 1 |
| 1433 | 0.729 | 1 |
| 1434 | 0.728 | 1 |
| 1435 | 0.728 | 1 |
| 1436 | 0.726 | 1 |
| 1437 | 0.725 | 1 |
| 1438 | 0.724 | 1 |
| 1439 | 0.724 | 1 |
| 1440 | 0.723 | 1 |
| 1441 | 0.722 | 1 |
| 1442 | 0.722 | 1 |
| 1443 | 0.721 | 1 |
| 1444 | 0.72 | 1 |
| 1445 | 0.719 | 1 |
| 1446 | 0.718 | 1 |
| 1447 | 0.717 | 1 |
| 1448 | 0.716 | 1 |
| 1449 | 0.715 | 1 |
| 1450 | 0.714 | 1 |
| 1451 | 0.713 | 1 |
| 1452 | 0.712 | 1 |
| 1453 | 0.711 | 1 |
| 1454 | 0.71 | 1 |
| 1455 | 0.708 | 1 |
| 1456 | 0.707 | 1 |
| 1457 | 0.706 | 1 |
| 1458 | 0.705 | 1 |
| 1459 | 0.705 | 1 |
| 1460 | 0.704 | 1 |
| 1461 | 0.703 | 1 |
| 1462 | 0.702 | 1 |
| 1463 | 0.701 | 1 |
| 1464 | 0.701 | 1 |
| 1465 | 0.7 | 1 |
| 1466 | 0.699 | 1 |
| 1467 | 0.698 | 1 |
| 1468 | 0.697 | 1 |
| 1469 | 0.696 | 1 |
| 1470 | 0.695 | 1 |
| 1471 | 0.694 | 1 |
| 1472 | 0.693 | 1 |
| 1473 | 0.693 | 1 |
| 1474 | 0.692 | 1 |
| 1475 | 0.691 | 1 |
| 1476 | 0.69 | 1 |
| 1477 | 0.689 | 1 |
| 1478 | 0.689 | 1 |
| 1479 | 0.688 | 1 |
| 1480 | 0.688 | 1 |
| 1481 | 0.687 | 1 |
| 1482 | 0.685 | 1 |
| 1483 | 0.685 | 1 |
| 1484 | 0.684 | 1 |
| 1485 | 0.683 | 1 |
| 1486 | 0.682 | 1 |
| 1487 | 0.681 | 1 |
| 1488 | 0.68 | 1 |
| 1489 | 0.679 | 1 |
| 1490 | 0.678 | 1 |
| 1491 | 0.678 | 1 |
| 1492 | 0.676 | 1 |
| 1493 | 0.675 | 1 |
| 1494 | 0.674 | 1 |
| 1495 | 0.673 | 1 |
| 1496 | 0.672 | 1 |
| 1497 | 0.671 | 1 |
| 1498 | 0.671 | 1 |
| 1499 | 0.67 | 1 |
| 1500 | 0.669 | 1 |
| 1501 | 0.668 | 1 |
| 1502 | 0.667 | 1 |
| 1503 | 0.666 | 1 |
| 1504 | 0.666 | 1 |
| 1505 | 0.664 | 1 |
| 1506 | 0.663 | 1 |
| 1507 | 0.663 | 1 |
| 1508 | 0.661 | 1 |
| 1509 | 0.66 | 1 |
| 1510 | 0.66 | 1 |
| 1511 | 0.659 | 1 |
| 1512 | 0.659 | 1 |
| 1513 | 0.658 | 1 |
| 1514 | 0.657 | 1 |
| 1515 | 0.657 | 1 |
| 1516 | 0.656 | 1 |
| 1517 | 0.655 | 1 |
| 1518 | 0.654 | 1 |
| 1519 | 0.654 | 1 |
| 1520 | 0.653 | 1 |
| 1521 | 0.652 | 1 |
| 1522 | 0.651 | 1 |
| 1523 | 0.651 | 1 |
| 1524 | 0.65 | 1 |
| 1525 | 0.649 | 1 |
| 1526 | 0.648 | 1 |
| 1527 | 0.648 | 1 |
| 1528 | 0.647 | 1 |
| 1529 | 0.647 | 1 |
| 1530 | 0.646 | 1 |
| 1531 | 0.646 | 1 |
| 1532 | 0.645 | 1 |
| 1533 | 0.644 | 1 |
| 1534 | 0.643 | 1 |
| 1535 | 0.642 | 1 |
| 1536 | 0.642 | 1 |
| 1537 | 0.641 | 1 |
| 1538 | 0.641 | 1 |
| 1539 | 0.638 | 1 |
| 1540 | 0.638 | 1 |
| 1541 | 0.636 | 1 |
| 1542 | 0.636 | 1 |
| 1543 | 0.635 | 1 |
| 1544 | 0.634 | 1 |
| 1545 | 0.633 | 1 |
| 1546 | 0.633 | 1 |
| 1547 | 0.631 | 1 |
| 1548 | 0.631 | 1 |
| 1549 | 0.63 | 1 |
| 1550 | 0.63 | 1 |
| 1551 | 0.629 | 1 |
| 1552 | 0.628 | 1 |
| 1553 | 0.628 | 1 |
| 1554 | 0.627 | 1 |
| 1555 | 0.627 | 1 |
| 1556 | 0.626 | 1 |
| 1557 | 0.625 | 1 |
| 1558 | 0.624 | 1 |
| 1559 | 0.624 | 1 |
| 1560 | 0.623 | 1 |
| 1561 | 0.623 | 1 |
| 1562 | 0.623 | 1 |
| 1563 | 0.622 | 1 |
| 1564 | 0.62 | 1 |
| 1565 | 0.62 | 1 |
| 1566 | 0.619 | 1 |
| 1567 | 0.618 | 1 |
| 1568 | 0.618 | 1 |
| 1569 | 0.617 | 1 |
| 1570 | 0.616 | 1 |
| 1571 | 0.616 | 1 |
| 1572 | 0.616 | 1 |
| 1573 | 0.614 | 1 |
| 1574 | 0.614 | 1 |
| 1575 | 0.613 | 1 |
| 1576 | 0.611 | 1 |
| 1577 | 0.611 | 1 |
| 1578 | 0.61 | 1 |
| 1579 | 0.61 | 1 |
| 1580 | 0.608 | 1 |
| 1581 | 0.607 | 1 |
| 1582 | 0.606 | 1 |
| 1583 | 0.606 | 1 |
| 1584 | 0.605 | 1 |
| 1585 | 0.605 | 1 |
| 1586 | 0.604 | 1 |
| 1587 | 0.603 | 1 |
| 1588 | 0.603 | 1 |
| 1589 | 0.602 | 1 |
| 1590 | 0.601 | 1 |
| 1591 | 0.601 | 1 |
| 1592 | 0.6 | 1 |
| 1593 | 0.599 | 1 |
| 1594 | 0.599 | 1 |
| 1595 | 0.599 | 1 |
| 1596 | 0.598 | 1 |
| 1597 | 0.597 | 1 |
| 1598 | 0.596 | 1 |
| 1599 | 0.596 | 1 |
| 1600 | 0.595 | 1 |
| 1601 | 0.594 | 1 |
| 1602 | 0.594 | 1 |
| 1603 | 0.594 | 1 |
| 1604 | 0.593 | 1 |
| 1605 | 0.592 | 1 |
| 1606 | 0.592 | 1 |
| 1607 | 0.591 | 1 |
| 1608 | 0.59 | 1 |
| 1609 | 0.589 | 1 |
| 1610 | 0.588 | 1 |
| 1611 | 0.588 | 1 |
| 1612 | 0.587 | 1 |
| 1613 | 0.586 | 1 |
| 1614 | 0.586 | 1 |
| 1615 | 0.585 | 1 |
| 1616 | 0.584 | 1 |
| 1617 | 0.583 | 1 |
| 1618 | 0.582 | 1 |
| 1619 | 0.582 | 1 |
| 1620 | 0.581 | 1 |
| 1621 | 0.581 | 1 |
| 1622 | 0.58 | 1 |
| 1623 | 0.58 | 1 |
| 1624 | 0.579 | 1 |
| 1625 | 0.579 | 1 |
| 1626 | 0.578 | 1 |
| 1627 | 0.577 | 1 |
| 1628 | 0.577 | 1 |
| 1629 | 0.576 | 1 |
| 1630 | 0.576 | 1 |
| 1631 | 0.574 | 1 |
| 1632 | 0.574 | 1 |
| 1633 | 0.573 | 1 |
| 1634 | 0.573 | 1 |
| 1635 | 0.572 | 1 |
| 1636 | 0.572 | 1 |
| 1637 | 0.571 | 1 |
| 1638 | 0.57 | 1 |
| 1639 | 0.57 | 1 |
| 1640 | 0.57 | 1 |
| 1641 | 0.569 | 1 |
| 1642 | 0.568 | 1 |
| 1643 | 0.568 | 1 |
| 1644 | 0.567 | 1 |
| 1645 | 0.567 | 1 |
| 1646 | 0.566 | 1 |
| 1647 | 0.565 | 1 |
| 1648 | 0.564 | 1 |
| 1649 | 0.564 | 1 |
| 1650 | 0.563 | 1 |
| 1651 | 0.562 | 1 |
| 1652 | 0.562 | 1 |
| 1653 | 0.561 | 1 |
| 1654 | 0.561 | 1 |
| 1655 | 0.559 | 1 |
| 1656 | 0.559 | 1 |
| 1657 | 0.558 | 1 |
| 1658 | 0.557 | 1 |
| 1659 | 0.557 | 1 |
| 1660 | 0.556 | 1 |
| 1661 | 0.555 | 1 |
| 1662 | 0.555 | 1 |
| 1663 | 0.554 | 1 |
| 1664 | 0.554 | 1 |
| 1665 | 0.552 | 1 |
| 1666 | 0.552 | 1 |
| 1667 | 0.551 | 1 |
| 1668 | 0.551 | 1 |
| 1669 | 0.55 | 1 |
| 1670 | 0.55 | 1 |
| 1671 | 0.549 | 1 |
| 1672 | 0.549 | 1 |
| 1673 | 0.548 | 1 |
| 1674 | 0.547 | 1 |
| 1675 | 0.547 | 1 |
| 1676 | 0.545 | 1 |
| 1677 | 0.545 | 1 |
| 1678 | 0.545 | 1 |
| 1679 | 0.544 | 1 |
| 1680 | 0.543 | 1 |
| 1681 | 0.542 | 1 |
| 1682 | 0.541 | 1 |
| 1683 | 0.541 | 1 |
| 1684 | 0.54 | 1 |
| 1685 | 0.54 | 1 |
| 1686 | 0.539 | 1 |
| 1687 | 0.539 | 1 |
| 1688 | 0.538 | 1 |
| 1689 | 0.538 | 1 |
| 1690 | 0.537 | 1 |
| 1691 | 0.536 | 1 |
| 1692 | 0.535 | 1 |
| 1693 | 0.534 | 1 |
| 1694 | 0.534 | 1 |
| 1695 | 0.533 | 1 |
| 1696 | 0.532 | 1 |
| 1697 | 0.531 | 1 |
| 1698 | 0.531 | 1 |
| 1699 | 0.53 | 1 |
| 1700 | 0.529 | 1 |
| 1701 | 0.528 | 1 |
| 1702 | 0.527 | 1 |
| 1703 | 0.526 | 1 |
| 1704 | 0.526 | 1 |
| 1705 | 0.526 | 1 |
| 1706 | 0.525 | 1 |
| 1707 | 0.525 | 1 |
| 1708 | 0.524 | 1 |
| 1709 | 0.523 | 1 |
| 1710 | 0.522 | 1 |
| 1711 | 0.521 | 1 |
| 1712 | 0.519 | 1 |
| 1713 | 0.518 | 1 |
| 1714 | 0.517 | 1 |
| 1715 | 0.517 | 1 |
| 1716 | 0.517 | 1 |
| 1717 | 0.516 | 1 |
| 1718 | 0.516 | 1 |
| 1719 | 0.515 | 1 |
| 1720 | 0.514 | 1 |
| 1721 | 0.513 | 1 |
| 1722 | 0.512 | 1 |
| 1723 | 0.511 | 1 |
| 1724 | 0.511 | 1 |
| 1725 | 0.51 | 1 |
| 1726 | 0.51 | 1 |
| 1727 | 0.509 | 1 |
| 1728 | 0.508 | 1 |
| 1729 | 0.508 | 1 |
| 1730 | 0.507 | 1 |
| 1731 | 0.506 | 1 |
| 1732 | 0.505 | 1 |
| 1733 | 0.504 | 1 |
| 1734 | 0.503 | 1 |
| 1735 | 0.502 | 1 |
| 1736 | 0.501 | 1 |
| 1737 | 0.501 | 1 |
| 1738 | 0.499 | 1 |
| 1739 | 0.498 | 1 |
| 1740 | 0.498 | 1 |
| 1741 | 0.497 | 1 |
| 1742 | 0.496 | 1 |
| 1743 | 0.495 | 1 |
| 1744 | 0.495 | 1 |
| 1745 | 0.494 | 1 |
| 1746 | 0.493 | 1 |
| 1747 | 0.492 | 1 |
| 1748 | 0.491 | 1 |
| 1749 | 0.49 | 1 |
| 1750 | 0.489 | 1 |
| 1751 | 0.488 | 1 |
| 1752 | 0.487 | 1 |
| 1753 | 0.486 | 1 |
| 1754 | 0.486 | 1 |
| 1755 | 0.485 | 1 |
| 1756 | 0.484 | 1 |
| 1757 | 0.483 | 1 |
| 1758 | 0.481 | 1 |
| 1759 | 0.48 | 1 |
| 1760 | 0.479 | 1 |
| 1761 | 0.479 | 1 |
| 1762 | 0.478 | 1 |
| 1763 | 0.478 | 1 |
| 1764 | 0.477 | 1 |
| 1765 | 0.476 | 1 |
| 1766 | 0.476 | 1 |
| 1767 | 0.475 | 1 |
| 1768 | 0.474 | 1 |
| 1769 | 0.473 | 1 |
| 1770 | 0.472 | 1 |
| 1771 | 0.471 | 1 |
| 1772 | 0.47 | 1 |
| 1773 | 0.469 | 1 |
| 1774 | 0.468 | 1 |
| 1775 | 0.467 | 1 |
| 1776 | 0.466 | 1 |
| 1777 | 0.465 | 1 |
| 1778 | 0.463 | 1 |
| 1779 | 0.463 | 1 |
| 1780 | 0.462 | 1 |
| 1781 | 0.461 | 1 |
| 1782 | 0.461 | 1 |
| 1783 | 0.46 | 1 |
| 1784 | 0.458 | 1 |
| 1785 | 0.458 | 1 |
| 1786 | 0.457 | 1 |
| 1787 | 0.456 | 1 |
| 1788 | 0.455 | 1 |
| 1789 | 0.454 | 1 |
| 1790 | 0.453 | 1 |
| 1791 | 0.452 | 1 |
| 1792 | 0.451 | 1 |
| 1793 | 0.45 | 1 |
| 1794 | 0.449 | 1 |
| 1795 | 0.448 | 1 |
| 1796 | 0.447 | 1 |
| 1797 | 0.445 | 1 |
| 1798 | 0.444 | 1 |
| 1799 | 0.444 | 1 |
| 1800 | 0.443 | 1 |
| 1801 | 0.443 | 1 |
| 1802 | 0.442 | 1 |
| 1803 | 0.442 | 1 |
| 1804 | 0.441 | 1 |
| 1805 | 0.441 | 1 |
| 1806 | 0.44 | 1 |
| 1807 | 0.44 | 1 |
| 1808 | 0.439 | 1 |
| 1809 | 0.438 | 1 |
| 1810 | 0.437 | 1 |
| 1811 | 0.436 | 1 |
| 1812 | 0.435 | 1 |
| 1813 | 0.435 | 1 |
| 1814 | 0.434 | 1 |
| 1815 | 0.432 | 1 |
| 1816 | 0.431 | 1 |
| 1817 | 0.43 | 1 |
| 1818 | 0.429 | 1 |
| 1819 | 0.428 | 1 |
| 1820 | 0.427 | 1 |
| 1821 | 0.427 | 1 |
| 1822 | 0.426 | 1 |
| 1823 | 0.425 | 1 |
| 1824 | 0.423 | 1 |
| 1825 | 0.423 | 1 |
| 1826 | 0.422 | 1 |
| 1827 | 0.421 | 1 |
| 1828 | 0.42 | 1 |
| 1829 | 0.419 | 1 |
| 1830 | 0.418 | 1 |
| 1831 | 0.417 | 1 |
| 1832 | 0.416 | 1 |
| 1833 | 0.415 | 1 |
| 1834 | 0.414 | 1 |
| 1835 | 0.413 | 1 |
| 1836 | 0.412 | 1 |
| 1837 | 0.411 | 1 |
| 1838 | 0.411 | 1 |
| 1839 | 0.41 | 1 |
| 1840 | 0.41 | 1 |
| 1841 | 0.409 | 1 |
| 1842 | 0.408 | 1 |
| 1843 | 0.407 | 1 |
| 1844 | 0.407 | 1 |
| 1845 | 0.407 | 1 |
| 1846 | 0.406 | 1 |
| 1847 | 0.405 | 1 |
| 1848 | 0.404 | 1 |
| 1849 | 0.403 | 1 |
| 1850 | 0.402 | 1 |
| 1851 | 0.401 | 1 |
| 1852 | 0.4 | 1 |
| 1853 | 0.399 | 1 |
| 1854 | 0.399 | 1 |
| 1855 | 0.398 | 1 |
| 1856 | 0.397 | 1 |
| 1857 | 0.395 | 1 |
| 1858 | 0.395 | 1 |
| 1859 | 0.394 | 1 |
| 1860 | 0.393 | 1 |
| 1861 | 0.392 | 1 |
| 1862 | 0.391 | 1 |
| 1863 | 0.39 | 1 |
| 1864 | 0.389 | 1 |
| 1865 | 0.389 | 1 |
| 1866 | 0.388 | 1 |
| 1867 | 0.387 | 1 |
| 1868 | 0.385 | 1 |
| 1869 | 0.385 | 1 |
| 1870 | 0.383 | 1 |
| 1871 | 0.382 | 1 |
| 1872 | 0.382 | 1 |
| 1873 | 0.381 | 1 |
| 1874 | 0.38 | 1 |
| 1875 | 0.379 | 1 |
| 1876 | 0.379 | 1 |
| 1877 | 0.378 | 1 |
| 1878 | 0.377 | 1 |
| 1879 | 0.377 | 1 |
| 1880 | 0.376 | 1 |
| 1881 | 0.374 | 1 |
| 1882 | 0.374 | 1 |
| 1883 | 0.373 | 1 |
| 1884 | 0.373 | 1 |
| 1885 | 0.372 | 1 |
| 1886 | 0.372 | 1 |
| 1887 | 0.371 | 1 |
| 1888 | 0.37 | 1 |
| 1889 | 0.37 | 1 |
| 1890 | 0.369 | 1 |
| 1891 | 0.368 | 1 |
| 1892 | 0.367 | 1 |
| 1893 | 0.366 | 1 |
| 1894 | 0.365 | 1 |
| 1895 | 0.364 | 1 |
| 1896 | 0.363 | 1 |
| 1897 | 0.363 | 1 |
| 1898 | 0.362 | 1 |
| 1899 | 0.361 | 1 |
| 1900 | 0.36 | 1 |
| 1901 | 0.359 | 1 |
| 1902 | 0.358 | 1 |
| 1903 | 0.357 | 1 |
| 1904 | 0.357 | 1 |
| 1905 | 0.357 | 1 |
| 1906 | 0.355 | 1 |
| 1907 | 0.354 | 1 |
| 1908 | 0.353 | 1 |
| 1909 | 0.351 | 1 |
| 1910 | 0.35 | 1 |
| 1911 | 0.35 | 1 |
| 1912 | 0.349 | 1 |
| 1913 | 0.348 | 1 |
| 1914 | 0.347 | 1 |
| 1915 | 0.346 | 1 |
| 1916 | 0.346 | 1 |
| 1917 | 0.345 | 1 |
| 1918 | 0.345 | 1 |
| 1919 | 0.344 | 1 |
| 1920 | 0.343 | 1 |
| 1921 | 0.342 | 1 |
| 1922 | 0.341 | 1 |
| 1923 | 0.341 | 1 |
| 1924 | 0.34 | 1 |
| 1925 | 0.34 | 1 |
| 1926 | 0.339 | 1 |
| 1927 | 0.338 | 1 |
| 1928 | 0.337 | 1 |
| 1929 | 0.336 | 1 |
| 1930 | 0.335 | 1 |
| 1931 | 0.334 | 1 |
| 1932 | 0.334 | 1 |
| 1933 | 0.333 | 1 |
| 1934 | 0.331 | 1 |
| 1935 | 0.331 | 1 |
| 1936 | 0.33 | 1 |
| 1937 | 0.329 | 1 |
| 1938 | 0.329 | 1 |
| 1939 | 0.328 | 1 |
| 1940 | 0.328 | 1 |
| 1941 | 0.327 | 1 |
| 1942 | 0.326 | 1 |
| 1943 | 0.325 | 1 |
| 1944 | 0.325 | 1 |
| 1945 | 0.324 | 1 |
| 1946 | 0.324 | 1 |
| 1947 | 0.323 | 1 |
| 1948 | 0.323 | 1 |
| 1949 | 0.322 | 1 |
| 1950 | 0.321 | 1 |
| 1951 | 0.319 | 1 |
| 1952 | 0.319 | 1 |
| 1953 | 0.318 | 1 |
| 1954 | 0.317 | 1 |
| 1955 | 0.316 | 1 |
| 1956 | 0.315 | 1 |
| 1957 | 0.315 | 1 |
| 1958 | 0.315 | 1 |
| 1959 | 0.314 | 1 |
| 1960 | 0.314 | 1 |
| 1961 | 0.312 | 1 |
| 1962 | 0.312 | 1 |
| 1963 | 0.311 | 1 |
| 1964 | 0.311 | 1 |
| 1965 | 0.311 | 1 |
| 1966 | 0.31 | 1 |
| 1967 | 0.309 | 1 |
| 1968 | 0.309 | 1 |
| 1969 | 0.308 | 1 |
| 1970 | 0.306 | 1 |
| 1971 | 0.306 | 1 |
| 1972 | 0.305 | 1 |
| 1973 | 0.304 | 1 |
| 1974 | 0.303 | 1 |
| 1975 | 0.301 | 1 |
| 1976 | 0.301 | 1 |
| 1977 | 0.3 | 1 |
| 1978 | 0.3 | 1 |
| 1979 | 0.299 | 1 |
| 1980 | 0.299 | 1 |
| 1981 | 0.298 | 1 |
| 1982 | 0.297 | 1 |
| 1983 | 0.297 | 1 |
| 1984 | 0.296 | 1 |
| 1985 | 0.296 | 1 |
| 1986 | 0.295 | 1 |
| 1987 | 0.294 | 1 |
| 1988 | 0.294 | 1 |
| 1989 | 0.293 | 1 |
| 1990 | 0.292 | 1 |
| 1991 | 0.292 | 1 |
| 1992 | 0.292 | 1 |
| 1993 | 0.291 | 1 |
| 1994 | 0.29 | 1 |
| 1995 | 0.289 | 1 |
| 1996 | 0.288 | 1 |
| 1997 | 0.288 | 1 |
| 1998 | 0.287 | 1 |
| 1999 | 0.287 | 1 |
| 2000 | 0.286 | 1 |
| 2001 | 0.285 | 1 |
| 2002 | 0.284 | 1 |
| 2003 | 0.284 | 1 |
| 2004 | 0.283 | 1 |
| 2005 | 0.283 | 1 |
| 2006 | 0.282 | 1 |
| 2007 | 0.281 | 1 |
| 2008 | 0.281 | 1 |
| 2009 | 0.28 | 1 |
| 2010 | 0.28 | 1 |
| 2011 | 0.278 | 1 |
| 2012 | 0.277 | 1 |
| 2013 | 0.277 | 1 |
| 2014 | 0.276 | 1 |
| 2015 | 0.275 | 1 |
| 2016 | 0.274 | 1 |
| 2017 | 0.274 | 1 |
| 2018 | 0.273 | 1 |
| 2019 | 0.273 | 1 |
| 2020 | 0.273 | 1 |
| 2021 | 0.272 | 1 |
| 2022 | 0.272 | 1 |
| 2023 | 0.271 | 1 |
| 2024 | 0.271 | 1 |
| 2025 | 0.27 | 1 |
| 2026 | 0.27 | 1 |
| 2027 | 0.27 | 1 |
| 2028 | 0.269 | 1 |
| 2029 | 0.268 | 1 |
| 2030 | 0.267 | 1 |
| 2031 | 0.267 | 1 |
| 2032 | 0.267 | 1 |
| 2033 | 0.266 | 1 |
| 2034 | 0.266 | 1 |
| 2035 | 0.265 | 1 |
| 2036 | 0.263 | 1 |
| 2037 | 0.263 | 1 |
| 2038 | 0.261 | 1 |
| 2039 | 0.261 | 1 |
| 2040 | 0.261 | 1 |
| 2041 | 0.26 | 1 |
| 2042 | 0.26 | 1 |
| 2043 | 0.259 | 1 |
| 2044 | 0.259 | 1 |
| 2045 | 0.258 | 1 |
| 2046 | 0.258 | 1 |
| 2047 | 0.257 | 1 |
| 2048 | 0.257 | 1 |
| 2049 | 0.257 | 1 |
| 2050 | 0.256 | 1 |
| 2051 | 0.255 | 1 |
| 2052 | 0.253 | 1 |
| 2053 | 0.253 | 1 |
| 2054 | 0.252 | 1 |
| 2055 | 0.252 | 1 |
| 2056 | 0.251 | 1 |
| 2057 | 0.25 | 1 |
| 2058 | 0.249 | 1 |
| 2059 | 0.249 | 1 |
| 2060 | 0.249 | 1 |
| 2061 | 0.248 | 1 |
| 2062 | 0.248 | 1 |
| 2063 | 0.247 | 1 |
| 2064 | 0.246 | 1 |
| 2065 | 0.246 | 1 |
| 2066 | 0.245 | 1 |
| 2067 | 0.244 | 1 |
| 2068 | 0.244 | 1 |
| 2069 | 0.244 | 1 |
| 2070 | 0.243 | 1 |
| 2071 | 0.243 | 1 |
| 2072 | 0.243 | 1 |
| 2073 | 0.242 | 1 |
| 2074 | 0.241 | 1 |
| 2075 | 0.241 | 1 |
| 2076 | 0.24 | 1 |
| 2077 | 0.24 | 1 |
| 2078 | 0.238 | 1 |
| 2079 | 0.238 | 1 |
| 2080 | 0.237 | 1 |
| 2081 | 0.237 | 1 |
| 2082 | 0.236 | 1 |
| 2083 | 0.236 | 1 |
| 2084 | 0.236 | 1 |
| 2085 | 0.235 | 1 |
| 2086 | 0.235 | 1 |
| 2087 | 0.235 | 1 |
| 2088 | 0.234 | 1 |
| 2089 | 0.234 | 1 |
| 2090 | 0.234 | 1 |
| 2091 | 0.233 | 1 |
| 2092 | 0.233 | 1 |
| 2093 | 0.233 | 1 |
| 2094 | 0.232 | 1 |
| 2095 | 0.23 | 1 |
| 2096 | 0.23 | 1 |
| 2097 | 0.229 | 1 |
| 2098 | 0.229 | 1 |
| 2099 | 0.228 | 1 |
| 2100 | 0.226 | 1 |
| 2101 | 0.225 | 1 |
| 2102 | 0.225 | 1 |
| 2103 | 0.225 | 1 |
| 2104 | 0.224 | 1 |
| 2105 | 0.224 | 1 |
| 2106 | 0.224 | 1 |
| 2107 | 0.223 | 1 |
| 2108 | 0.223 | 1 |
| 2109 | 0.222 | 1 |
| 2110 | 0.222 | 1 |
| 2111 | 0.222 | 1 |
| 2112 | 0.222 | 1 |
| 2113 | 0.221 | 1 |
| 2114 | 0.221 | 1 |
| 2115 | 0.221 | 1 |
| 2116 | 0.22 | 1 |
| 2117 | 0.219 | 1 |
| 2118 | 0.218 | 1 |
| 2119 | 0.218 | 1 |
| 2120 | 0.217 | 1 |
| 2121 | 0.216 | 1 |
| 2122 | 0.214 | 1 |
| 2123 | 0.213 | 1 |
| 2124 | 0.212 | 1 |
| 2125 | 0.212 | 1 |
| 2126 | 0.212 | 1 |
| 2127 | 0.211 | 1 |
| 2128 | 0.211 | 1 |
| 2129 | 0.21 | 1 |
| 2130 | 0.21 | 1 |
| 2131 | 0.21 | 1 |
| 2132 | 0.209 | 1 |
| 2133 | 0.209 | 1 |
| 2134 | 0.209 | 1 |
| 2135 | 0.208 | 1 |
| 2136 | 0.208 | 1 |
| 2137 | 0.208 | 1 |
| 2138 | 0.207 | 1 |
| 2139 | 0.206 | 1 |
| 2140 | 0.205 | 1 |
| 2141 | 0.204 | 1 |
| 2142 | 0.204 | 1 |
| 2143 | 0.203 | 1 |
| 2144 | 0.203 | 1 |
| 2145 | 0.201 | 1 |
| 2146 | 0.2 | 1 |
| 2147 | 0.199 | 1 |
| 2148 | 0.199 | 0.999 |
| 2149 | 0.199 | 0.999 |
| 2150 | 0.198 | 0.999 |
| 2151 | 0.198 | 0.999 |
| 2152 | 0.197 | 0.999 |
| 2153 | 0.197 | 0.999 |
| 2154 | 0.197 | 0.999 |
| 2155 | 0.196 | 0.999 |
| 2156 | 0.196 | 0.999 |
| 2157 | 0.195 | 0.999 |
| 2158 | 0.195 | 0.999 |
| 2159 | 0.195 | 0.999 |
| 2160 | 0.195 | 0.999 |
| 2161 | 0.194 | 0.999 |
| 2162 | 0.194 | 0.999 |
| 2163 | 0.192 | 0.999 |
| 2164 | 0.192 | 0.999 |
| 2165 | 0.192 | 0.999 |
| 2166 | 0.191 | 0.999 |
| 2167 | 0.19 | 0.999 |
| 2168 | 0.189 | 0.999 |
| 2169 | 0.188 | 0.999 |
| 2170 | 0.187 | 0.999 |
| 2171 | 0.186 | 0.999 |
| 2172 | 0.186 | 0.999 |
| 2173 | 0.186 | 0.999 |
| 2174 | 0.186 | 0.999 |
| 2175 | 0.185 | 0.999 |
| 2176 | 0.185 | 0.999 |
| 2177 | 0.185 | 0.999 |
| 2178 | 0.184 | 0.999 |
| 2179 | 0.184 | 0.999 |
| 2180 | 0.184 | 0.999 |
| 2181 | 0.184 | 0.999 |
| 2182 | 0.183 | 0.999 |
| 2183 | 0.183 | 0.999 |
| 2184 | 0.182 | 0.999 |
| 2185 | 0.182 | 0.999 |
| 2186 | 0.18 | 0.999 |
| 2187 | 0.18 | 0.999 |
| 2188 | 0.179 | 0.999 |
| 2189 | 0.178 | 0.999 |
| 2190 | 0.177 | 0.999 |
| 2191 | 0.176 | 0.999 |
| 2192 | 0.175 | 0.999 |
| 2193 | 0.174 | 0.999 |
| 2194 | 0.173 | 0.999 |
| 2195 | 0.173 | 0.999 |
| 2196 | 0.172 | 0.999 |
| 2197 | 0.172 | 0.999 |
| 2198 | 0.172 | 0.999 |
| 2199 | 0.171 | 0.999 |
| 2200 | 0.171 | 0.999 |
| 2201 | 0.171 | 0.999 |
| 2202 | 0.171 | 0.999 |
| 2203 | 0.17 | 0.999 |
| 2204 | 0.17 | 0.999 |
| 2205 | 0.169 | 0.999 |
| 2206 | 0.169 | 0.999 |
| 2207 | 0.169 | 0.999 |
| 2208 | 0.168 | 0.999 |
| 2209 | 0.167 | 0.999 |
| 2210 | 0.167 | 0.999 |
| 2211 | 0.166 | 0.999 |
| 2212 | 0.164 | 0.999 |
| 2213 | 0.164 | 0.999 |
| 2214 | 0.163 | 0.999 |
| 2215 | 0.162 | 0.999 |
| 2216 | 0.161 | 0.999 |
| 2217 | 0.16 | 0.999 |
| 2218 | 0.159 | 0.999 |
| 2219 | 0.158 | 0.999 |
| 2220 | 0.158 | 0.999 |
| 2221 | 0.158 | 0.999 |
| 2222 | 0.157 | 0.999 |
| 2223 | 0.157 | 0.999 |
| 2224 | 0.157 | 0.999 |
| 2225 | 0.157 | 0.999 |
| 2226 | 0.157 | 0.999 |
| 2227 | 0.157 | 0.999 |
| 2228 | 0.156 | 0.999 |
| 2229 | 0.155 | 0.999 |
| 2230 | 0.155 | 0.999 |
| 2231 | 0.154 | 0.999 |
| 2232 | 0.153 | 0.999 |
| 2233 | 0.153 | 0.999 |
| 2234 | 0.151 | 0.999 |
| 2235 | 0.15 | 0.999 |
| 2236 | 0.15 | 0.999 |
| 2237 | 0.149 | 0.999 |
| 2238 | 0.149 | 0.999 |
| 2239 | 0.147 | 0.999 |
| 2240 | 0.146 | 0.999 |
| 2241 | 0.145 | 0.999 |
| 2242 | 0.143 | 0.999 |
| 2243 | 0.143 | 0.999 |
| 2244 | 0.143 | 0.999 |
| 2245 | 0.142 | 0.999 |
| 2246 | 0.142 | 0.999 |
| 2247 | 0.142 | 0.999 |
| 2248 | 0.142 | 0.999 |
| 2249 | 0.142 | 0.999 |
| 2250 | 0.142 | 0.999 |
| 2251 | 0.141 | 0.999 |
| 2252 | 0.14 | 0.999 |
| 2253 | 0.14 | 0.999 |
| 2254 | 0.14 | 0.999 |
| 2255 | 0.139 | 0.998 |
| 2256 | 0.139 | 0.998 |
| 2257 | 0.137 | 0.998 |
| 2258 | 0.136 | 0.998 |
| 2259 | 0.136 | 0.998 |
| 2260 | 0.135 | 0.998 |
| 2261 | 0.134 | 0.998 |
| 2262 | 0.134 | 0.998 |
| 2263 | 0.133 | 0.998 |
| 2264 | 0.132 | 0.998 |
| 2265 | 0.131 | 0.998 |
| 2266 | 0.129 | 0.998 |
| 2267 | 0.129 | 0.998 |
| 2268 | 0.129 | 0.998 |
| 2269 | 0.128 | 0.998 |
| 2270 | 0.128 | 0.998 |
| 2271 | 0.128 | 0.998 |
| 2272 | 0.128 | 0.998 |
| 2273 | 0.128 | 0.998 |
| 2274 | 0.127 | 0.998 |
| 2275 | 0.127 | 0.998 |
| 2276 | 0.127 | 0.998 |
| 2277 | 0.126 | 0.998 |
| 2278 | 0.126 | 0.998 |
| 2279 | 0.125 | 0.998 |
| 2280 | 0.124 | 0.998 |
| 2281 | 0.123 | 0.998 |
| 2282 | 0.122 | 0.998 |
| 2283 | 0.121 | 0.998 |
| 2284 | 0.121 | 0.998 |
| 2285 | 0.12 | 0.998 |
| 2286 | 0.119 | 0.998 |
| 2287 | 0.118 | 0.998 |
| 2288 | 0.117 | 0.998 |
| 2289 | 0.116 | 0.998 |
| 2290 | 0.114 | 0.998 |
| 2291 | 0.114 | 0.998 |
| 2292 | 0.114 | 0.998 |
| 2293 | 0.113 | 0.998 |
| 2294 | 0.113 | 0.998 |
| 2295 | 0.113 | 0.998 |
| 2296 | 0.113 | 0.998 |
| 2297 | 0.112 | 0.998 |
| 2298 | 0.112 | 0.998 |
| 2299 | 0.112 | 0.998 |
| 2300 | 0.112 | 0.998 |
| 2301 | 0.111 | 0.998 |
| 2302 | 0.111 | 0.998 |
| 2303 | 0.11 | 0.998 |
| 2304 | 0.11 | 0.998 |
| 2305 | 0.109 | 0.998 |
| 2306 | 0.108 | 0.998 |
| 2307 | 0.108 | 0.998 |
| 2308 | 0.107 | 0.998 |
| 2309 | 0.106 | 0.998 |
| 2310 | 0.106 | 0.998 |
| 2311 | 0.104 | 0.998 |
| 2312 | 0.104 | 0.998 |
| 2313 | 0.102 | 0.998 |
| 2314 | 0.101 | 0.998 |
| 2315 | 0.101 | 0.998 |
| 2316 | 0.101 | 0.998 |
| 2317 | 0.1 | 0.998 |
| 2318 | 0.1 | 0.997 |
| 2319 | 0.1 | 0.997 |
| 2320 | 0.1 | 0.997 |
| 2321 | 0.1 | 0.997 |
| 2322 | 0.1 | 0.997 |
| 2323 | 0.099 | 0.997 |
| 2324 | 0.099 | 0.997 |
| 2325 | 0.099 | 0.997 |
| 2326 | 0.098 | 0.997 |
| 2327 | 0.098 | 0.997 |
| 2328 | 0.097 | 0.997 |
| 2329 | 0.097 | 0.997 |
| 2330 | 0.096 | 0.997 |
| 2331 | 0.095 | 0.997 |
| 2332 | 0.094 | 0.997 |
| 2333 | 0.093 | 0.997 |
| 2334 | 0.092 | 0.997 |
| 2335 | 0.091 | 0.997 |
| 2336 | 0.091 | 0.997 |
| 2337 | 0.09 | 0.997 |
| 2338 | 0.088 | 0.997 |
| 2339 | 0.088 | 0.997 |
| 2340 | 0.088 | 0.997 |
| 2341 | 0.088 | 0.997 |
| 2342 | 0.087 | 0.997 |
| 2343 | 0.087 | 0.997 |
| 2344 | 0.087 | 0.997 |
| 2345 | 0.087 | 0.997 |
| 2346 | 0.086 | 0.997 |
| 2347 | 0.086 | 0.997 |
| 2348 | 0.085 | 0.997 |
| 2349 | 0.085 | 0.997 |
| 2350 | 0.085 | 0.997 |
| 2351 | 0.084 | 0.997 |
| 2352 | 0.084 | 0.997 |
| 2353 | 0.083 | 0.997 |
| 2354 | 0.082 | 0.997 |
| 2355 | 0.082 | 0.997 |
| 2356 | 0.082 | 0.997 |
| 2357 | 0.081 | 0.997 |
| 2358 | 0.08 | 0.997 |
| 2359 | 0.079 | 0.997 |
| 2360 | 0.078 | 0.997 |
| 2361 | 0.077 | 0.997 |
| 2362 | 0.076 | 0.997 |
| 2363 | 0.076 | 0.997 |
| 2364 | 0.075 | 0.997 |
| 2365 | 0.075 | 0.997 |
| 2366 | 0.075 | 0.997 |
| 2367 | 0.074 | 0.997 |
| 2368 | 0.074 | 0.997 |
| 2369 | 0.074 | 0.997 |
| 2370 | 0.074 | 0.997 |
| 2371 | 0.073 | 0.997 |
| 2372 | 0.073 | 0.997 |
| 2373 | 0.072 | 0.997 |
| 2374 | 0.072 | 0.997 |
| 2375 | 0.072 | 0.997 |
| 2376 | 0.071 | 0.997 |
| 2377 | 0.07 | 0.997 |
| 2378 | 0.07 | 0.997 |
| 2379 | 0.07 | 0.997 |
| 2380 | 0.069 | 0.996 |
| 2381 | 0.069 | 0.996 |
| 2382 | 0.068 | 0.996 |
| 2383 | 0.068 | 0.996 |
| 2384 | 0.067 | 0.996 |
| 2385 | 0.066 | 0.996 |
| 2386 | 0.065 | 0.996 |
| 2387 | 0.064 | 0.996 |
| 2388 | 0.063 | 0.996 |
| 2389 | 0.063 | 0.996 |
| 2390 | 0.063 | 0.996 |
| 2391 | 0.062 | 0.996 |
| 2392 | 0.062 | 0.996 |
| 2393 | 0.061 | 0.996 |
| 2394 | 0.061 | 0.996 |
| 2395 | 0.061 | 0.996 |
| 2396 | 0.061 | 0.996 |
| 2397 | 0.059 | 0.996 |
| 2398 | 0.059 | 0.996 |
| 2399 | 0.059 | 0.996 |
| 2400 | 0.059 | 0.996 |
| 2401 | 0.059 | 0.996 |
| 2402 | 0.058 | 0.996 |
| 2403 | 0.057 | 0.996 |
| 2404 | 0.057 | 0.996 |
| 2405 | 0.057 | 0.996 |
| 2406 | 0.057 | 0.996 |
| 2407 | 0.056 | 0.996 |
| 2408 | 0.055 | 0.995 |
| 2409 | 0.054 | 0.995 |
| 2410 | 0.054 | 0.995 |
| 2411 | 0.052 | 0.995 |
| 2412 | 0.052 | 0.995 |
| 2413 | 0.051 | 0.995 |
| 2414 | 0.051 | 0.995 |
| 2415 | 0.051 | 0.995 |
| 2416 | 0.051 | 0.995 |
| 2417 | 0.05 | 0.995 |
| 2418 | 0.05 | 0.995 |
| 2419 | 0.05 | 0.995 |
| 2420 | 0.05 | 0.995 |
| 2421 | 0.05 | 0.995 |
| 2422 | 0.049 | 0.995 |
| 2423 | 0.048 | 0.995 |
| 2424 | 0.048 | 0.995 |
| 2425 | 0.048 | 0.995 |
| 2426 | 0.048 | 0.995 |
| 2427 | 0.047 | 0.995 |
| 2428 | 0.047 | 0.995 |
| 2429 | 0.047 | 0.994 |
| 2430 | 0.046 | 0.994 |
| 2431 | 0.046 | 0.994 |
| 2432 | 0.046 | 0.994 |
| 2433 | 0.046 | 0.994 |
| 2434 | 0.046 | 0.994 |
| 2435 | 0.045 | 0.994 |
| 2436 | 0.044 | 0.994 |
| 2437 | 0.044 | 0.994 |
| 2438 | 0.043 | 0.994 |
| 2439 | 0.043 | 0.994 |
| 2440 | 0.043 | 0.994 |
| 2441 | 0.043 | 0.994 |
| 2442 | 0.042 | 0.994 |
| 2443 | 0.041 | 0.994 |
| 2444 | 0.041 | 0.994 |
| 2445 | 0.041 | 0.994 |
| 2446 | 0.041 | 0.993 |
| 2447 | 0.041 | 0.993 |
| 2448 | 0.041 | 0.993 |
| 2449 | 0.04 | 0.993 |
| 2450 | 0.04 | 0.993 |
| 2451 | 0.04 | 0.993 |
| 2452 | 0.039 | 0.993 |
| 2453 | 0.039 | 0.993 |
| 2454 | 0.039 | 0.993 |
| 2455 | 0.038 | 0.993 |
| 2456 | 0.038 | 0.992 |
| 2457 | 0.038 | 0.992 |
| 2458 | 0.037 | 0.992 |
| 2459 | 0.037 | 0.991 |
| 2460 | 0.037 | 0.991 |
| 2461 | 0.036 | 0.991 |
| 2462 | 0.036 | 0.991 |
| 2463 | 0.035 | 0.991 |
| 2464 | 0.035 | 0.991 |
| 2465 | 0.035 | 0.991 |
| 2466 | 0.035 | 0.991 |
| 2467 | 0.035 | 0.991 |
| 2468 | 0.034 | 0.991 |
| 2469 | 0.033 | 0.991 |
| 2470 | 0.033 | 0.991 |
| 2471 | 0.033 | 0.991 |
| 2472 | 0.033 | 0.991 |
| 2473 | 0.033 | 0.991 |
| 2474 | 0.032 | 0.991 |
| 2475 | 0.032 | 0.991 |
| 2476 | 0.032 | 0.991 |
| 2477 | 0.031 | 0.991 |
| 2478 | 0.031 | 0.991 |
| 2479 | 0.031 | 0.991 |
| 2480 | 0.031 | 0.991 |
| 2481 | 0.031 | 0.991 |
| 2482 | 0.031 | 0.991 |
| 2483 | 0.03 | 0.991 |
| 2484 | 0.03 | 0.991 |
| 2485 | 0.03 | 0.99 |
| 2486 | 0.03 | 0.99 |
| 2487 | 0.029 | 0.99 |
| 2488 | 0.029 | 0.99 |
| 2489 | 0.029 | 0.99 |
| 2490 | 0.029 | 0.99 |
| 2491 | 0.028 | 0.99 |
| 2492 | 0.028 | 0.99 |
| 2493 | 0.028 | 0.99 |
| 2494 | 0.028 | 0.99 |
| 2495 | 0.027 | 0.99 |
| 2496 | 0.027 | 0.99 |
| 2497 | 0.027 | 0.99 |
| 2498 | 0.026 | 0.99 |
| 2499 | 0.026 | 0.99 |
| 2500 | 0.026 | 0.989 |
| 2501 | 0.026 | 0.989 |
| 2502 | 0.025 | 0.989 |
| 2503 | 0.025 | 0.989 |
| 2504 | 0.025 | 0.989 |
| 2505 | 0.025 | 0.988 |
| 2506 | 0.025 | 0.988 |
| 2507 | 0.025 | 0.988 |
| 2508 | 0.024 | 0.988 |
| 2509 | 0.024 | 0.988 |
| 2510 | 0.024 | 0.988 |
| 2511 | 0.023 | 0.988 |
| 2512 | 0.023 | 0.988 |
| 2513 | 0.023 | 0.988 |
| 2514 | 0.023 | 0.988 |
| 2515 | 0.023 | 0.988 |
| 2516 | 0.023 | 0.988 |
| 2517 | 0.023 | 0.988 |
| 2518 | 0.022 | 0.988 |
| 2519 | 0.022 | 0.988 |
| 2520 | 0.021 | 0.988 |
| 2521 | 0.021 | 0.988 |
| 2522 | 0.021 | 0.988 |
| 2523 | 0.02 | 0.988 |
| 2524 | 0.02 | 0.988 |
| 2525 | 0.02 | 0.988 |
| 2526 | 0.019 | 0.988 |
| 2527 | 0.019 | 0.988 |
| 2528 | 0.018 | 0.988 |
| 2529 | 0.018 | 0.987 |
| 2530 | 0.018 | 0.987 |
| 2531 | 0.018 | 0.987 |
| 2532 | 0.018 | 0.987 |
| 2533 | 0.018 | 0.987 |
| 2534 | 0.018 | 0.987 |
| 2535 | 0.018 | 0.987 |
| 2536 | 0.018 | 0.987 |
| 2537 | 0.018 | 0.987 |
| 2538 | 0.018 | 0.987 |
| 2539 | 0.018 | 0.987 |
| 2540 | 0.018 | 0.987 |
| 2541 | 0.018 | 0.987 |
| 2542 | 0.018 | 0.987 |
| 2543 | 0.018 | 0.987 |
| 2544 | 0.017 | 0.987 |
| 2545 | 0.016 | 0.987 |
| 2546 | 0.016 | 0.987 |
| 2547 | 0.016 | 0.987 |
| 2548 | 0.015 | 0.987 |
| 2549 | 0.015 | 0.987 |
| 2550 | 0.015 | 0.987 |
| 2551 | 0.015 | 0.987 |
| 2552 | 0.014 | 0.987 |
| 2553 | 0.014 | 0.986 |
| 2554 | 0.014 | 0.986 |
| 2555 | 0.014 | 0.985 |
| 2556 | 0.014 | 0.985 |
| 2557 | 0.014 | 0.985 |
| 2558 | 0.014 | 0.985 |
| 2559 | 0.014 | 0.985 |
| 2560 | 0.014 | 0.985 |
| 2561 | 0.014 | 0.985 |
| 2562 | 0.014 | 0.985 |
| 2563 | 0.014 | 0.985 |
| 2564 | 0.014 | 0.985 |
| 2565 | 0.013 | 0.985 |
| 2566 | 0.013 | 0.985 |
| 2567 | 0.013 | 0.984 |
| 2568 | 0.013 | 0.984 |
| 2569 | 0.013 | 0.984 |
| 2570 | 0.013 | 0.984 |
| 2571 | 0.013 | 0.984 |
| 2572 | 0.012 | 0.984 |
| 2573 | 0.012 | 0.984 |
| 2574 | 0.011 | 0.984 |
| 2575 | 0.011 | 0.984 |
| 2576 | 0.011 | 0.984 |
| 2577 | 0.011 | 0.984 |
| 2578 | 0.01 | 0.984 |
| 2579 | 0.01 | 0.984 |
| 2580 | 0.01 | 0.984 |
| 2581 | 0.01 | 0.984 |
| 2582 | 0.01 | 0.983 |
| 2583 | 0.01 | 0.983 |
| 2584 | 0.01 | 0.983 |
| 2585 | 0.01 | 0.981 |
| 2586 | 0.01 | 0.981 |
| 2587 | 0.01 | 0.981 |
| 2588 | 0.01 | 0.981 |
| 2589 | 0.01 | 0.981 |
| 2590 | 0.01 | 0.981 |
| 2591 | 0.01 | 0.981 |
| 2592 | 0.01 | 0.981 |
| 2593 | 0.01 | 0.98 |
| 2594 | 0.01 | 0.98 |
| 2595 | 0.01 | 0.98 |
| 2596 | 0.01 | 0.98 |
| 2597 | 0.01 | 0.98 |
| 2598 | 0.009 | 0.98 |
| 2599 | 0.009 | 0.98 |
| 2600 | 0.009 | 0.98 |
| 2601 | 0.008 | 0.98 |
| 2602 | 0.008 | 0.98 |
| 2603 | 0.008 | 0.98 |
| 2604 | 0.008 | 0.98 |
| 2605 | 0.008 | 0.975 |
| 2606 | 0.008 | 0.975 |
| 2607 | 0.008 | 0.975 |
| 2608 | 0.008 | 0.975 |
| 2609 | 0.008 | 0.975 |
| 2610 | 0.008 | 0.975 |
| 2611 | 0.008 | 0.975 |
| 2612 | 0.008 | 0.975 |
| 2613 | 0.008 | 0.974 |
| 2614 | 0.008 | 0.974 |
| 2615 | 0.008 | 0.974 |
| 2616 | 0.008 | 0.974 |
| 2617 | 0.008 | 0.974 |
| 2618 | 0.008 | 0.974 |
| 2619 | 0.008 | 0.974 |
| 2620 | 0.008 | 0.974 |
| 2621 | 0.008 | 0.974 |
| 2622 | 0.008 | 0.974 |
| 2623 | 0.008 | 0.974 |
| 2624 | 0.008 | 0.974 |
| 2625 | 0.007 | 0.974 |
| 2626 | 0.007 | 0.974 |
| 2627 | 0.006 | 0.974 |
| 2628 | 0.006 | 0.974 |
| 2629 | 0.006 | 0.973 |
| 2630 | 0.006 | 0.973 |
| 2631 | 0.006 | 0.973 |
| 2632 | 0.006 | 0.973 |
| 2633 | 0.006 | 0.973 |
| 2634 | 0.006 | 0.973 |
| 2635 | 0.006 | 0.97 |
| 2636 | 0.006 | 0.97 |
| 2637 | 0.006 | 0.97 |
| 2638 | 0.006 | 0.97 |
| 2639 | 0.006 | 0.97 |
| 2640 | 0.006 | 0.97 |
| 2641 | 0.006 | 0.97 |
| 2642 | 0.006 | 0.97 |
| 2643 | 0.006 | 0.969 |
| 2644 | 0.006 | 0.969 |
| 2645 | 0.006 | 0.969 |
| 2646 | 0.006 | 0.969 |
| 2647 | 0.006 | 0.969 |
| 2648 | 0.006 | 0.969 |
| 2649 | 0.006 | 0.969 |
| 2650 | 0.006 | 0.969 |
| 2651 | 0.006 | 0.969 |
| 2652 | 0.005 | 0.969 |
| 2653 | 0.005 | 0.967 |
| 2654 | 0.004 | 0.967 |
| 2655 | 0.004 | 0.962 |
| 2656 | 0.004 | 0.961 |
| 2657 | 0.004 | 0.961 |
| 2658 | 0.004 | 0.961 |
| 2659 | 0.004 | 0.961 |
| 2660 | 0.004 | 0.961 |
| 2661 | 0.004 | 0.961 |
| 2662 | 0.004 | 0.961 |
| 2663 | 0.004 | 0.961 |
| 2664 | 0.004 | 0.961 |
| 2665 | 0.004 | 0.961 |
| 2666 | 0.004 | 0.961 |
| 2667 | 0.004 | 0.961 |
| 2668 | 0.004 | 0.961 |
| 2669 | 0.004 | 0.961 |
| 2670 | 0.004 | 0.961 |
| 2671 | 0.004 | 0.961 |
| 2672 | 0.004 | 0.961 |
| 2673 | 0.004 | 0.961 |
| 2674 | 0.004 | 0.961 |
| 2675 | 0.004 | 0.96 |
| 2676 | 0.004 | 0.96 |
| 2677 | 0.004 | 0.96 |
| 2678 | 0.004 | 0.96 |
| 2679 | 0.003 | 0.96 |
| 2680 | 0.003 | 0.96 |
| 2681 | 0.003 | 0.96 |
| 2682 | 0.003 | 0.96 |
| 2683 | 0.003 | 0.96 |
| 2684 | 0.003 | 0.96 |
| 2685 | 0.003 | 0.96 |
| 2686 | 0.003 | 0.96 |
| 2687 | 0.003 | 0.96 |
| 2688 | 0.003 | 0.959 |
| 2689 | 0.003 | 0.959 |
| 2690 | 0.003 | 0.959 |
| 2691 | 0.003 | 0.959 |
| 2692 | 0.003 | 0.959 |
| 2693 | 0.003 | 0.959 |
| 2694 | 0.003 | 0.959 |
| 2695 | 0.003 | 0.958 |
| 2696 | 0.003 | 0.958 |
| 2697 | 0.003 | 0.958 |
| 2698 | 0.003 | 0.958 |
| 2699 | 0.003 | 0.958 |
| 2700 | 0.003 | 0.958 |
| 2701 | 0.003 | 0.958 |
| 2702 | 0.003 | 0.958 |
| 2703 | 0.003 | 0.958 |
| 2704 | 0.003 | 0.958 |
| 2705 | 0.003 | 0.958 |
| 2706 | 0.003 | 0.958 |
| 2707 | 0.002 | 0.958 |
| 2708 | 0.002 | 0.956 |
| 2709 | 0.002 | 0.956 |
| 2710 | 0.002 | 0.956 |
| 2711 | 0.002 | 0.956 |
| 2712 | 0.002 | 0.956 |
| 2713 | 0.002 | 0.956 |
| 2714 | 0.002 | 0.956 |
| 2715 | 0.002 | 0.956 |
| 2716 | 0.002 | 0.956 |
| 2717 | 0.002 | 0.956 |
| 2718 | 0.002 | 0.956 |
| 2719 | 0.002 | 0.956 |
| 2720 | 0.002 | 0.955 |
| 2721 | 0.002 | 0.955 |
| 2722 | 0.002 | 0.955 |
| 2723 | 0.002 | 0.955 |
| 2724 | 0.002 | 0.955 |
| 2725 | 0.002 | 0.955 |
| 2726 | 0.002 | 0.955 |
| 2727 | 0.002 | 0.955 |
| 2728 | 0.002 | 0.955 |
| 2729 | 0.002 | 0.955 |
| 2730 | 0.002 | 0.955 |
| 2731 | 0.002 | 0.955 |
| 2732 | 0.002 | 0.954 |
| 2733 | 0.002 | 0.954 |
| 2734 | 0.002 | 0.954 |
| 2735 | 0.002 | 0.954 |
| 2736 | 0.001 | 0.954 |
| 2737 | 0.001 | 0.954 |
| 2738 | 0.001 | 0.953 |
| 2739 | 0.001 | 0.953 |
| 2740 | 0.001 | 0.953 |
| 2741 | 0.001 | 0.953 |
| 2742 | 0.001 | 0.953 |
| 2743 | 0.001 | 0.953 |
| 2744 | 0.001 | 0.953 |
| 2745 | 0.001 | 0.953 |
| 2746 | 0.001 | 0.953 |
| 2747 | 0.001 | 0.953 |
| 2748 | 0.001 | 0.952 |
| 2749 | 0.001 | 0.952 |
| 2750 | 0.001 | 0.951 |
| 2751 | 0.001 | 0.951 |
| 2752 | 0.001 | 0.951 |
| 2753 | 0.001 | 0.951 |
| 2754 | 0.001 | 0.951 |
| 2755 | 0.001 | 0.951 |
| 2756 | 0.001 | 0.95 |
| 2757 | 0.001 | 0.95 |
| 2758 | 0.001 | 0.949 |
| 2759 | 0.001 | 0.949 |
| 2760 | 0.001 | 0.949 |
| 2761 | 0.001 | 0.949 |
| 2762 | 0.001 | 0.949 |
| 2763 | 0.001 | 0.949 |
| 2764 | 0.001 | 0.949 |
| 2765 | 0.001 | 0.949 |
| 2766 | 0.001 | 0.949 |
| 2767 | 0.001 | 0.949 |
| 2768 | 0.001 | 0.948 |
| 2769 | 0.001 | 0.948 |
| 2770 | 0.001 | 0.948 |
| 2771 | 0.001 | 0.948 |
| 2772 | 0.001 | 0.948 |
| 2773 | 0.001 | 0.948 |
| 2774 | 0.001 | 0.947 |
| 2775 | 0.001 | 0.947 |
| 2776 | 0.001 | 0.947 |
| 2777 | 0.001 | 0.947 |
| 2778 | 0.001 | 0.947 |
| 2779 | 0.001 | 0.947 |
| 2780 | 0.001 | 0.946 |
| 2781 | 0.001 | 0.946 |
| 2782 | 0.001 | 0.946 |
| 2783 | 0.001 | 0.946 |
| 2784 | 0.001 | 0.946 |
| 2785 | 0.001 | 0.946 |
| 2786 | 0.001 | 0.946 |
| 2787 | 0.001 | 0.946 |
| 2788 | 0.001 | 0.941 |
| 2789 | 0.001 | 0.941 |
| 2790 | 0.001 | 0.941 |
| 2791 | 0.001 | 0.941 |
| 2792 | 0.001 | 0.941 |
| 2793 | 0 | 0.941 |
| 2794 | 0 | 0.941 |
| 2795 | 0 | 0.941 |
| 2796 | 0 | 0.94 |
| 2797 | 0 | 0.94 |
| 2798 | 0 | 0.94 |
| 2799 | 0 | 0.94 |
| 2800 | 0 | 0.938 |
| 2801 | 0 | 0.938 |
| 2802 | 0 | 0.938 |
| 2803 | 0 | 0.938 |
| 2804 | 0 | 0.938 |
| 2805 | 0 | 0.938 |
| 2806 | 0 | 0.938 |
| 2807 | 0 | 0.938 |
| 2808 | 0 | 0.927 |
| 2809 | 0 | 0.927 |
| 2810 | 0 | 0.926 |
| 2811 | 0 | 0.926 |
| 2812 | 0 | 0.926 |
| 2813 | 0 | 0.926 |
| 2814 | 0 | 0.926 |
| 2815 | 0 | 0.926 |
| 2816 | 0 | 0.926 |
| 2817 | 0 | 0.926 |
| 2818 | 0 | 0.925 |
| 2819 | 0 | 0.925 |
| 2820 | 0 | 0.925 |
| 2821 | 0 | 0.925 |
| 2822 | 0 | 0.925 |
| 2823 | 0 | 0.925 |
| 2824 | 0 | 0.925 |
| 2825 | 0 | 0.925 |
| 2826 | 0 | 0.925 |
| 2827 | 0 | 0.925 |
| 2828 | 0 | 0.925 |
| 2829 | 0 | 0.924 |
| 2830 | 0 | 0.919 |
| 2831 | 0 | 0.919 |
| 2832 | 0 | 0.919 |
| 2833 | 0 | 0.919 |
| 2834 | 0 | 0.919 |
| 2835 | 0 | 0.919 |
| 2836 | 0 | 0.919 |
| 2837 | 0 | 0.919 |
| 2838 | 0 | 0.916 |
| 2839 | 0 | 0.916 |
| 2840 | 0 | 0.916 |
| 2841 | 0 | 0.916 |
| 2842 | 0 | 0.916 |
| 2843 | 0 | 0.916 |
| 2844 | 0 | 0.916 |
| 2845 | 0 | 0.916 |
| 2846 | 0 | 0.915 |
| 2847 | 0 | 0.915 |
| 2848 | 0 | 0.915 |
| 2849 | 0 | 0.915 |
| 2850 | 0 | 0.904 |
| 2851 | 0 | 0.904 |
| 2852 | 0 | 0.904 |
| 2853 | 0 | 0.904 |
| 2854 | 0 | 0.904 |
| 2855 | 0 | 0.904 |
| 2856 | 0 | 0.903 |
| 2857 | 0 | 0.903 |
| 2858 | 0 | 0.9 |
| 2859 | 0 | 0.9 |
| 2860 | 0 | 0.899 |
| 2861 | 0 | 0.899 |
| 2862 | 0 | 0.899 |
| 2863 | 0 | 0.899 |
| 2864 | 0 | 0.899 |
| 2865 | 0 | 0.899 |
| 2866 | 0 | 0.899 |
| 2867 | 0 | 0.899 |
| 2868 | 0 | 0.899 |
| 2869 | 0 | 0.899 |
| 2870 | 0 | 0.899 |
| 2871 | 0 | 0.899 |
| 2872 | 0 | 0.899 |
| 2873 | 0 | 0.898 |
| 2874 | 0 | 0.898 |
| 2875 | 0 | 0.898 |
| 2876 | 0 | 0.898 |
| 2877 | 0 | 0.898 |
| 2878 | 0 | 0.898 |
| 2879 | 0 | 0.897 |
| 2880 | 0 | 0.896 |
| 2881 | 0 | 0.896 |
| 2882 | 0 | 0.896 |
| 2883 | 0 | 0.896 |
| 2884 | 0 | 0.896 |
| 2885 | 0 | 0.892 |
| 2886 | 0 | 0.892 |
| 2887 | 0 | 0.892 |
| 2888 | 0 | 0.892 |
| 2889 | 0 | 0.891 |
| 2890 | 0 | 0.891 |
| 2891 | 0 | 0.891 |
| 2892 | 0 | 0.891 |
| 2893 | 0 | 0.89 |
| 2894 | 0 | 0.89 |
| 2895 | 0 | 0.89 |
| 2896 | 0 | 0.89 |
| 2897 | 0 | 0.89 |
| 2898 | 0 | 0.889 |
| 2899 | 0 | 0.889 |
| 2900 | 0 | 0.886 |
| 2901 | 0 | 0.886 |
| 2902 | 0 | 0.886 |
| 2903 | 0 | 0.886 |
| 2904 | 0 | 0.886 |
| 2905 | 0 | 0.877 |
| 2906 | 0 | 0.877 |
| 2907 | 0 | 0.877 |
| 2908 | 0 | 0.877 |
| 2909 | 0 | 0.875 |
| 2910 | 0 | 0.875 |
| 2911 | 0 | 0.875 |
| 2912 | 0 | 0.875 |
| 2913 | 0 | 0.875 |
| 2914 | 0 | 0.875 |
| 2915 | 0 | 0.874 |
| 2916 | 0 | 0.874 |
| 2917 | 0 | 0.874 |
| 2918 | 0 | 0.874 |
| 2919 | 0 | 0.874 |
| 2920 | 0 | 0.874 |
| 2921 | 0 | 0.874 |
| 2922 | 0 | 0.874 |
| 2923 | 0 | 0.873 |
| 2924 | 0 | 0.873 |
| 2925 | 0 | 0.873 |
| 2926 | 0 | 0.873 |
| 2927 | 0 | 0.873 |
| 2928 | 0 | 0.873 |
| 2929 | 0 | 0.868 |
| 2930 | 0 | 0.868 |
| 2931 | 0 | 0.868 |
| 2932 | 0 | 0.868 |
| 2933 | 0 | 0.867 |
| 2934 | 0 | 0.867 |
| 2935 | 0 | 0.864 |
| 2936 | 0 | 0.864 |
| 2937 | 0 | 0.864 |
| 2938 | 0 | 0.864 |
| 2939 | 0 | 0.864 |
| 2940 | 0 | 0.864 |
| 2941 | 0 | 0.864 |
| 2942 | 0 | 0.864 |
| 2943 | 0 | 0.863 |
| 2944 | 0 | 0.863 |
| 2945 | 0 | 0.863 |
| 2946 | 0 | 0.863 |
| 2947 | 0 | 0.863 |
| 2948 | 0 | 0.863 |
| 2949 | 0 | 0.863 |
| 2950 | 0 | 0.863 |
| 2951 | 0 | 0.863 |
| 2952 | 0 | 0.863 |
| 2953 | 0 | 0.861 |
| 2954 | 0 | 0.861 |
| 2955 | 0 | 0.855 |
| 2956 | 0 | 0.855 |
| 2957 | 0 | 0.855 |
| 2958 | 0 | 0.855 |
| 2959 | 0 | 0.854 |
| 2960 | 0 | 0.854 |
| 2961 | 0 | 0.854 |
| 2962 | 0 | 0.854 |
| 2963 | 0 | 0.854 |
| 2964 | 0 | 0.854 |
| 2965 | 0 | 0.849 |
| 2966 | 0 | 0.849 |
| 2967 | 0 | 0.848 |
| 2968 | 0 | 0.848 |
| 2969 | 0 | 0.848 |
| 2970 | 0 | 0.848 |
| 2971 | 0 | 0.848 |
| 2972 | 0 | 0.848 |
| 2973 | 0 | 0.845 |
| 2974 | 0 | 0.845 |
| 2975 | 0 | 0.845 |
| 2976 | 0 | 0.845 |
| 2977 | 0 | 0.845 |
| 2978 | 0 | 0.845 |
| 2979 | 0 | 0.843 |
| 2980 | 0 | 0.843 |
| 2981 | 0 | 0.842 |
| 2982 | 0 | 0.842 |
| 2983 | 0 | 0.842 |
| 2984 | 0 | 0.842 |
| 2985 | 0 | 0.813 |
| 2986 | 0 | 0.813 |
| 2987 | 0 | 0.813 |
| 2988 | 0 | 0.813 |
| 2989 | 0 | 0.813 |
| 2990 | 0 | 0.813 |
| 2991 | 0 | 0.812 |
| 2992 | 0 | 0.812 |
| 2993 | 0 | 0.805 |
| 2994 | 0 | 0.805 |
| 2995 | 0 | 0.805 |
| 2996 | 0 | 0.805 |
| 2997 | 0 | 0.805 |
| 2998 | 0 | 0.805 |
| 2999 | 0 | 0.804 |
| 3000 | 0 | 0.804 |
| 3001 | 0 | 0.804 |
| 3002 | 0 | 0.804 |
| 3003 | 0 | 0.804 |
| 3004 | 0 | 0.804 |
| 3005 | 0 | 0.738 |
| 3006 | 0 | 0.738 |
| 3007 | 0 | 0.738 |
| 3008 | 0 | 0.738 |
| 3009 | 0 | 0.738 |
| 3010 | 0 | 0.738 |
| 3011 | 0 | 0.736 |
| 3012 | 0 | 0.736 |
| 3013 | 0 | 0.735 |
| 3014 | 0 | 0.735 |
| 3015 | 0 | 0.734 |
| 3016 | 0 | 0.734 |
| 3017 | 0 | 0.734 |
| 3018 | 0 | 0.734 |
| 3019 | 0 | 0.733 |
| 3020 | 0 | 0.733 |
| 3021 | 0 | 0.733 |
| 3022 | 0 | 0.733 |
| 3023 | 0 | 0.732 |
| 3024 | 0 | 0.732 |
| 3025 | 0 | 0.732 |
| 3026 | 0 | 0.732 |
| 3027 | 0 | 0.732 |
| 3028 | 0 | 0.732 |
| 3029 | 0 | 0.732 |
| 3030 | 0 | 0.732 |
| 3031 | 0 | 0.732 |
| 3032 | 0 | 0.731 |
| 3033 | 0 | 0.729 |
| 3034 | 0 | 0.729 |
| 3035 | 0 | 0.72 |
| 3036 | 0 | 0.719 |
| 3037 | 0 | 0.719 |
| 3038 | 0 | 0.719 |
| 3039 | 0 | 0.719 |
| 3040 | 0 | 0.719 |
| 3041 | 0 | 0.719 |
| 3042 | 0 | 0.719 |
| 3043 | 0 | 0.717 |
| 3044 | 0 | 0.717 |
| 3045 | 0 | 0.716 |
| 3046 | 0 | 0.716 |
| 3047 | 0 | 0.716 |
| 3048 | 0 | 0.716 |
| 3049 | 0 | 0.716 |
| 3050 | 0 | 0.716 |
| 3051 | 0 | 0.716 |
| 3052 | 0 | 0.716 |
| 3053 | 0 | 0.71 |
| 3054 | 0 | 0.71 |
| 3055 | 0 | 0.689 |
| 3056 | 0 | 0.689 |
| 3057 | 0 | 0.689 |
| 3058 | 0 | 0.689 |
| 3059 | 0 | 0.689 |
| 3060 | 0 | 0.688 |
| 3061 | 0 | 0.688 |
| 3062 | 0 | 0.688 |
| 3063 | 0 | 0.688 |
| 3064 | 0 | 0.688 |
| 3065 | 0 | 0.688 |
| 3066 | 0 | 0.688 |
| 3067 | 0 | 0.688 |
| 3068 | 0 | 0.688 |
| 3069 | 0 | 0.688 |
| 3070 | 0 | 0.688 |
| 3071 | 0 | 0.688 |
| 3072 | 0 | 0.688 |
| 3073 | 0 | 0.688 |
| 3074 | 0 | 0.687 |
| 3075 | 0 | 0.686 |
| 3076 | 0 | 0.686 |
| 3077 | 0 | 0.686 |
| 3078 | 0 | 0.686 |
| 3079 | 0 | 0.686 |
| 3080 | 0 | 0.686 |
| 3081 | 0 | 0.686 |
| 3082 | 0 | 0.686 |
| 3083 | 0 | 0.685 |
| 3084 | 0 | 0.685 |
| 3085 | 0 | 0.685 |
| 3086 | 0 | 0.685 |
| 3087 | 0 | 0.685 |
| 3088 | 0 | 0.683 |
| 3089 | 0 | 0.683 |
| 3090 | 0 | 0.683 |
| 3091 | 0 | 0.683 |
| 3092 | 0 | 0.683 |
| 3093 | 0 | 0.683 |
| 3094 | 0 | 0.683 |
| 3095 | 0 | 0.681 |
| 3096 | 0 | 0.68 |
| 3097 | 0 | 0.68 |
| 3098 | 0 | 0.68 |
| 3099 | 0 | 0.68 |
| 3100 | 0 | 0.679 |
| 3101 | 0 | 0.679 |
| 3102 | 0 | 0.679 |
| 3103 | 0 | 0.679 |
| 3104 | 0 | 0.679 |
| 3105 | 0 | 0.679 |
| 3106 | 0 | 0.679 |
| 3107 | 0 | 0.679 |
| 3108 | 0 | 0.675 |
| 3109 | 0 | 0.675 |
| 3110 | 0 | 0.674 |
| 3111 | 0 | 0.674 |
| 3112 | 0 | 0.673 |
| 3113 | 0 | 0.673 |
| 3114 | 0 | 0.673 |
| 3115 | 0 | 0.673 |
| 3116 | 0 | 0.673 |
| 3117 | 0 | 0.673 |
| 3118 | 0 | 0.672 |
| 3119 | 0 | 0.672 |
| 3120 | 0 | 0.672 |
| 3121 | 0 | 0.672 |
| 3122 | 0 | 0.672 |
| 3123 | 0 | 0.672 |
| 3124 | 0 | 0.672 |
| 3125 | 0 | 0.672 |
| 3126 | 0 | 0.672 |
| 3127 | 0 | 0.672 |
| 3128 | 0 | 0.672 |
| 3129 | 0 | 0.672 |
| 3130 | 0 | 0.669 |
| 3131 | 0 | 0.669 |
| 3132 | 0 | 0.666 |
| 3133 | 0 | 0.666 |
| 3134 | 0 | 0.666 |
| 3135 | 0 | 0.666 |
| 3136 | 0 | 0.666 |
| 3137 | 0 | 0.666 |
| 3138 | 0 | 0.664 |
| 3139 | 0 | 0.664 |
| 3140 | 0 | 0.664 |
| 3141 | 0 | 0.664 |
| 3142 | 0 | 0.664 |
| 3143 | 0 | 0.664 |
| 3144 | 0 | 0.664 |
| 3145 | 0 | 0.664 |
| 3146 | 0 | 0.664 |
| 3147 | 0 | 0.664 |
| 3148 | 0 | 0.664 |
| 3149 | 0 | 0.664 |
| 3150 | 0 | 0.659 |
| 3151 | 0 | 0.659 |
| 3152 | 0 | 0.659 |
| 3153 | 0 | 0.659 |
| 3154 | 0 | 0.657 |
| 3155 | 0 | 0.657 |
| 3156 | 0 | 0.657 |
| 3157 | 0 | 0.657 |
| 3158 | 0 | 0.655 |
| 3159 | 0 | 0.655 |
| 3160 | 0 | 0.654 |
| 3161 | 0 | 0.654 |
| 3162 | 0 | 0.654 |
| 3163 | 0 | 0.654 |
| 3164 | 0 | 0.654 |
| 3165 | 0 | 0.654 |
| 3166 | 0 | 0.654 |
| 3167 | 0 | 0.654 |
| 3168 | 0 | 0.651 |
| 3169 | 0 | 0.651 |
| 3170 | 0 | 0.651 |
| 3171 | 0 | 0.651 |
| 3172 | 0 | 0.651 |
| 3173 | 0 | 0.651 |
| 3174 | 0 | 0.648 |
| 3175 | 0 | 0.648 |
| 3176 | 0 | 0.646 |
| 3177 | 0 | 0.646 |
| 3178 | 0 | 0.646 |
| 3179 | 0 | 0.646 |
| 3180 | 0 | 0.645 |
| 3181 | 0 | 0.645 |
| 3182 | 0 | 0.645 |
| 3183 | 0 | 0.645 |
| 3184 | 0 | 0.645 |
| 3185 | 0 | 0.644 |
| 3186 | 0 | 0.644 |
| 3187 | 0 | 0.644 |
| 3188 | 0 | 0.627 |
| 3189 | 0 | 0.627 |
| 3190 | 0 | 0.627 |
| 3191 | 0 | 0.627 |
| 3192 | 0 | 0.627 |
| 3193 | 0 | 0.627 |
| 3194 | 0 | 0.627 |
| 3195 | 0 | 0.627 |
| 3196 | 0 | 0.623 |
| 3197 | 0 | 0.623 |
| 3198 | 0 | 0.622 |
| 3199 | 0 | 0.622 |
| 3200 | 0 | 0.62 |
| 3201 | 0 | 0.62 |
| 3202 | 0 | 0.62 |
| 3203 | 0 | 0.62 |
| 3204 | 0 | 0.62 |
| 3205 | 0 | 0.619 |
| 3206 | 0 | 0.619 |
| 3207 | 0 | 0.619 |
| 3208 | 0 | 0.581 |
| 3209 | 0 | 0.58 |
| 3210 | 0 | 0.577 |
| 3211 | 0 | 0.577 |
| 3212 | 0 | 0.577 |
| 3213 | 0 | 0.577 |
| 3214 | 0 | 0.577 |
| 3215 | 0 | 0.577 |
| 3216 | 0 | 0.577 |
| 3217 | 0 | 0.577 |
| 3218 | 0 | 0.575 |
| 3219 | 0 | 0.575 |
| 3220 | 0 | 0.575 |
| 3221 | 0 | 0.575 |
| 3222 | 0 | 0.575 |
| 3223 | 0 | 0.575 |
| 3224 | 0 | 0.575 |
| 3225 | 0 | 0.575 |
| 3226 | 0 | 0.575 |
| 3227 | 0 | 0.575 |
| 3228 | 0 | 0.575 |
| 3229 | 0 | 0.572 |
| 3230 | 0 | 0.555 |
| 3231 | 0 | 0.555 |
| 3232 | 0 | 0.555 |
| 3233 | 0 | 0.555 |
| 3234 | 0 | 0.555 |
| 3235 | 0 | 0.554 |
| 3236 | 0 | 0.554 |
| 3237 | 0 | 0.554 |
| 3238 | 0 | 0.55 |
| 3239 | 0 | 0.55 |
| 3240 | 0 | 0.55 |
| 3241 | 0 | 0.55 |
| 3242 | 0 | 0.55 |
| 3243 | 0 | 0.549 |
| 3244 | 0 | 0.549 |
| 3245 | 0 | 0.549 |
| 3246 | 0 | 0.549 |
| 3247 | 0 | 0.549 |
| 3248 | 0 | 0.549 |
| 3249 | 0 | 0.549 |
| 3250 | 0 | 0.51 |
| 3251 | 0 | 0.51 |
| 3252 | 0 | 0.51 |
| 3253 | 0 | 0.509 |
| 3254 | 0 | 0.509 |
| 3255 | 0 | 0.507 |
| 3256 | 0 | 0.507 |
| 3257 | 0 | 0.507 |
| 3258 | 0 | 0.507 |
| 3259 | 0 | 0.507 |
| 3260 | 0 | 0.507 |
| 3261 | 0 | 0.507 |
| 3262 | 0 | 0.507 |
| 3263 | 0 | 0.507 |
| 3264 | 0 | 0.507 |
| 3265 | 0 | 0.504 |
| 3266 | 0 | 0.504 |
| 3267 | 0 | 0.504 |
| 3268 | 0 | 0.504 |
| 3269 | 0 | 0.504 |
| 3270 | 0 | 0.504 |
| 3271 | 0 | 0.504 |
| 3272 | 0 | 0.504 |
| 3273 | 0 | 0.503 |
| 3274 | 0 | 0.503 |
| 3275 | 0 | 0.503 |
| 3276 | 0 | 0.503 |
| 3277 | 0 | 0.503 |
| 3278 | 0 | 0.503 |
| 3279 | 0 | 0.501 |
| 3280 | 0 | 0.501 |
| 3281 | 0 | 0.501 |
| 3282 | 0 | 0.501 |
| 3283 | 0 | 0.501 |
| 3284 | 0 | 0.501 |
| 3285 | 0 | 0.488 |
| 3286 | 0 | 0.488 |
| 3287 | 0 | 0.488 |
| 3288 | 0 | 0.488 |
| 3289 | 0 | 0.487 |
| 3290 | 0 | 0.487 |
| 3291 | 0 | 0.487 |
| 3292 | 0 | 0.487 |
| 3293 | 0 | 0.483 |
| 3294 | 0 | 0.483 |
| 3295 | 0 | 0.483 |
| 3296 | 0 | 0.483 |
| 3297 | 0 | 0.482 |
| 3298 | 0 | 0.482 |
| 3299 | 0 | 0.482 |
| 3300 | 0 | 0.482 |
| 3301 | 0 | 0.482 |
| 3302 | 0 | 0.482 |
| 3303 | 0 | 0.482 |
| 3304 | 0 | 0.482 |
| 3305 | 0 | 0.452 |
| 3306 | 0 | 0.452 |
| 3307 | 0 | 0.452 |
| 3308 | 0 | 0.452 |
| 3309 | 0 | 0.444 |
| 3310 | 0 | 0.444 |
| 3311 | 0 | 0.444 |
| 3312 | 0 | 0.444 |
| 3313 | 0 | 0.444 |
| 3314 | 0 | 0.444 |
| 3315 | 0 | 0.443 |
| 3316 | 0 | 0.443 |
| 3317 | 0 | 0.441 |
| 3318 | 0 | 0.441 |
| 3319 | 0 | 0.441 |
| 3320 | 0 | 0.441 |
| 3321 | 0 | 0.441 |
| 3322 | 0 | 0.441 |
| 3323 | 0 | 0.44 |
| 3324 | 0 | 0.44 |
| 3325 | 0 | 0.44 |
| 3326 | 0 | 0.44 |
| 3327 | 0 | 0.44 |
| 3328 | 0 | 0.44 |
| 3329 | 0 | 0.421 |
| 3330 | 0 | 0.421 |
| 3331 | 0 | 0.421 |
| 3332 | 0 | 0.421 |
| 3333 | 0 | 0.421 |
| 3334 | 0 | 0.421 |
| 3335 | 0 | 0.414 |
| 3336 | 0 | 0.414 |
| 3337 | 0 | 0.414 |
| 3338 | 0 | 0.414 |
| 3339 | 0 | 0.414 |
| 3340 | 0 | 0.414 |
| 3341 | 0 | 0.414 |
| 3342 | 0 | 0.414 |
| 3343 | 0 | 0.413 |
| 3344 | 0 | 0.413 |
| 3345 | 0 | 0.411 |
| 3346 | 0 | 0.411 |
| 3347 | 0 | 0.411 |
| 3348 | 0 | 0.411 |
| 3349 | 0 | 0.411 |
| 3350 | 0 | 0.411 |
| 3351 | 0 | 0.411 |
| 3352 | 0 | 0.411 |
| 3353 | 0 | 0.41 |
| 3354 | 0 | 0.41 |
| 3355 | 0 | 0.395 |
| 3356 | 0 | 0.395 |
| 3357 | 0 | 0.395 |
| 3358 | 0 | 0.395 |
| 3359 | 0 | 0.395 |
| 3360 | 0 | 0.395 |
| 3361 | 0 | 0.395 |
| 3362 | 0 | 0.395 |
| 3363 | 0 | 0.395 |
| 3364 | 0 | 0.395 |
| 3365 | 0 | 0.377 |
| 3366 | 0 | 0.377 |
| 3367 | 0 | 0.377 |
| 3368 | 0 | 0.377 |
| 3369 | 0 | 0.377 |
| 3370 | 0 | 0.377 |
| 3371 | 0 | 0.377 |
| 3372 | 0 | 0.377 |
| 3373 | 0 | 0.367 |
| 3374 | 0 | 0.367 |
| 3375 | 0 | 0.367 |
| 3376 | 0 | 0.367 |
| 3377 | 0 | 0.367 |
| 3378 | 0 | 0.367 |
| 3379 | 0 | 0.367 |
| 3380 | 0 | 0.367 |
| 3381 | 0 | 0.366 |
| 3382 | 0 | 0.366 |
| 3383 | 0 | 0.366 |
| 3384 | 0 | 0.366 |
| 3385 | 0 | 0.261 |
| 3386 | 0 | 0.261 |
| 3387 | 0 | 0.261 |
| 3388 | 0 | 0.261 |
| 3389 | 0 | 0.261 |
| 3390 | 0 | 0.261 |
| 3391 | 0 | 0.261 |
| 3392 | 0 | 0.261 |
| 3393 | 0 | 0.236 |
| 3394 | 0 | 0.236 |
| 3395 | 0 | 0.236 |
| 3396 | 0 | 0.236 |
| 3397 | 0 | 0.236 |
| 3398 | 0 | 0.236 |
| 3399 | 0 | 0.236 |
| 3400 | 0 | 0.236 |
| 3401 | 0 | 0.236 |
| 3402 | 0 | 0.236 |
| 3403 | 0 | 0.236 |
| 3404 | 0 | 0.236 |